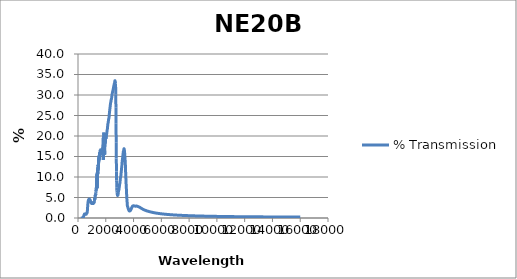
| Category | % Transmission |
|---|---|
| 200.0 | 0 |
| 201.0 | 0 |
| 202.0 | 0 |
| 203.0 | 0 |
| 204.0 | 0 |
| 205.0 | 0 |
| 206.0 | 0 |
| 207.0 | 0 |
| 208.0 | 0 |
| 209.0 | 0 |
| 210.0 | 0 |
| 211.0 | 0 |
| 212.0 | 0 |
| 213.0 | 0 |
| 214.0 | 0 |
| 215.0 | 0 |
| 216.0 | 0 |
| 217.0 | 0 |
| 218.0 | 0 |
| 219.0 | 0 |
| 220.0 | 0 |
| 221.0 | 0 |
| 222.0 | 0 |
| 223.0 | 0 |
| 224.0 | 0 |
| 225.0 | 0 |
| 226.0 | 0 |
| 227.0 | 0 |
| 228.0 | 0 |
| 229.0 | 0 |
| 230.0 | 0 |
| 231.0 | 0 |
| 232.0 | 0 |
| 233.0 | 0 |
| 234.0 | 0 |
| 235.0 | 0 |
| 236.0 | 0 |
| 237.0 | 0 |
| 238.0 | 0 |
| 239.0 | 0 |
| 240.0 | 0 |
| 241.0 | 0 |
| 242.0 | 0 |
| 243.0 | 0 |
| 244.0 | 0 |
| 245.0 | 0 |
| 246.0 | 0 |
| 247.0 | 0 |
| 248.0 | 0 |
| 249.0 | 0 |
| 250.0 | 0 |
| 251.0 | 0 |
| 252.0 | 0 |
| 253.0 | 0 |
| 254.0 | 0 |
| 255.0 | 0 |
| 256.0 | 0 |
| 257.0 | 0 |
| 258.0 | 0 |
| 259.0 | 0 |
| 260.0 | 0 |
| 261.0 | 0 |
| 262.0 | 0 |
| 263.0 | 0 |
| 264.0 | 0 |
| 265.0 | 0 |
| 266.0 | 0 |
| 267.0 | 0 |
| 268.0 | 0 |
| 269.0 | 0 |
| 270.0 | 0 |
| 271.0 | 0 |
| 272.0 | 0 |
| 273.0 | 0 |
| 274.0 | 0 |
| 275.0 | 0 |
| 276.0 | 0 |
| 277.0 | 0 |
| 278.0 | 0 |
| 279.0 | 0 |
| 280.0 | 0 |
| 281.0 | 0 |
| 282.0 | 0 |
| 283.0 | 0 |
| 284.0 | 0 |
| 285.0 | 0 |
| 286.0 | 0 |
| 287.0 | 0 |
| 288.0 | 0 |
| 289.0 | 0 |
| 290.0 | 0 |
| 291.0 | 0 |
| 292.0 | 0 |
| 293.0 | 0 |
| 294.0 | 0 |
| 295.0 | 0 |
| 296.0 | 0 |
| 297.0 | 0 |
| 298.0 | 0 |
| 299.0 | 0 |
| 300.0 | 0 |
| 301.0 | 0 |
| 302.0 | 0 |
| 303.0 | 0 |
| 304.0 | 0 |
| 305.0 | 0 |
| 306.0 | 0 |
| 307.0 | 0 |
| 308.0 | 0 |
| 309.0 | 0 |
| 310.0 | 0 |
| 311.0 | 0 |
| 312.0 | 0 |
| 313.0 | 0 |
| 314.0 | 0 |
| 315.0 | 0 |
| 316.0 | 0 |
| 317.0 | 0 |
| 318.0 | 0 |
| 319.0 | 0 |
| 320.0 | 0 |
| 321.0 | 0 |
| 322.0 | 0 |
| 323.0 | 0 |
| 324.0 | 0 |
| 325.0 | 0 |
| 326.0 | 0 |
| 327.0 | 0 |
| 328.0 | 0 |
| 329.0 | 0 |
| 330.0 | 0 |
| 331.0 | 0 |
| 332.0 | 0 |
| 333.0 | 0 |
| 334.0 | 0 |
| 335.0 | 0 |
| 336.0 | 0 |
| 337.0 | 0 |
| 338.0 | 0 |
| 339.0 | 0 |
| 340.0 | 0 |
| 341.0 | 0 |
| 342.0 | 0 |
| 343.0 | 0 |
| 344.0 | 0 |
| 345.0 | 0 |
| 346.0 | 0 |
| 347.0 | 0 |
| 348.0 | 0 |
| 349.0 | 0 |
| 350.0 | 0 |
| 351.0 | 0 |
| 352.0 | 0 |
| 353.0 | 0 |
| 354.0 | 0.001 |
| 355.0 | 0.001 |
| 356.0 | 0.001 |
| 357.0 | 0.002 |
| 358.0 | 0.002 |
| 359.0 | 0.003 |
| 360.0 | 0.004 |
| 361.0 | 0.006 |
| 362.0 | 0.007 |
| 363.0 | 0.009 |
| 364.0 | 0.011 |
| 365.0 | 0.014 |
| 366.0 | 0.016 |
| 367.0 | 0.02 |
| 368.0 | 0.023 |
| 369.0 | 0.027 |
| 370.0 | 0.031 |
| 371.0 | 0.034 |
| 372.0 | 0.037 |
| 373.0 | 0.039 |
| 374.0 | 0.04 |
| 375.0 | 0.041 |
| 376.0 | 0.041 |
| 377.0 | 0.042 |
| 378.0 | 0.044 |
| 379.0 | 0.047 |
| 380.0 | 0.051 |
| 381.0 | 0.058 |
| 382.0 | 0.067 |
| 383.0 | 0.077 |
| 384.0 | 0.09 |
| 385.0 | 0.103 |
| 386.0 | 0.118 |
| 387.0 | 0.135 |
| 388.0 | 0.153 |
| 389.0 | 0.172 |
| 390.0 | 0.192 |
| 391.0 | 0.212 |
| 392.0 | 0.231 |
| 393.0 | 0.251 |
| 394.0 | 0.272 |
| 395.0 | 0.292 |
| 396.0 | 0.312 |
| 397.0 | 0.332 |
| 398.0 | 0.351 |
| 399.0 | 0.369 |
| 400.0 | 0.387 |
| 401.0 | 0.404 |
| 402.0 | 0.42 |
| 403.0 | 0.434 |
| 404.0 | 0.446 |
| 405.0 | 0.457 |
| 406.0 | 0.466 |
| 407.0 | 0.475 |
| 408.0 | 0.484 |
| 409.0 | 0.491 |
| 410.0 | 0.497 |
| 411.0 | 0.503 |
| 412.0 | 0.51 |
| 413.0 | 0.518 |
| 414.0 | 0.526 |
| 415.0 | 0.534 |
| 416.0 | 0.542 |
| 417.0 | 0.55 |
| 418.0 | 0.56 |
| 419.0 | 0.571 |
| 420.0 | 0.583 |
| 421.0 | 0.594 |
| 422.0 | 0.604 |
| 423.0 | 0.615 |
| 424.0 | 0.626 |
| 425.0 | 0.639 |
| 426.0 | 0.652 |
| 427.0 | 0.662 |
| 428.0 | 0.671 |
| 429.0 | 0.679 |
| 430.0 | 0.687 |
| 431.0 | 0.695 |
| 432.0 | 0.702 |
| 433.0 | 0.706 |
| 434.0 | 0.708 |
| 435.0 | 0.708 |
| 436.0 | 0.71 |
| 437.0 | 0.711 |
| 438.0 | 0.713 |
| 439.0 | 0.714 |
| 440.0 | 0.714 |
| 441.0 | 0.717 |
| 442.0 | 0.722 |
| 443.0 | 0.73 |
| 444.0 | 0.74 |
| 445.0 | 0.749 |
| 446.0 | 0.759 |
| 447.0 | 0.771 |
| 448.0 | 0.786 |
| 449.0 | 0.803 |
| 450.0 | 0.82 |
| 451.0 | 0.835 |
| 452.0 | 0.849 |
| 453.0 | 0.863 |
| 454.0 | 0.879 |
| 455.0 | 0.895 |
| 456.0 | 0.909 |
| 457.0 | 0.922 |
| 458.0 | 0.932 |
| 459.0 | 0.943 |
| 460.0 | 0.954 |
| 461.0 | 0.965 |
| 462.0 | 0.974 |
| 463.0 | 0.979 |
| 464.0 | 0.982 |
| 465.0 | 0.984 |
| 466.0 | 0.987 |
| 467.0 | 0.99 |
| 468.0 | 0.991 |
| 469.0 | 0.99 |
| 470.0 | 0.986 |
| 471.0 | 0.983 |
| 472.0 | 0.981 |
| 473.0 | 0.979 |
| 474.0 | 0.976 |
| 475.0 | 0.972 |
| 476.0 | 0.967 |
| 477.0 | 0.963 |
| 478.0 | 0.96 |
| 479.0 | 0.958 |
| 480.0 | 0.954 |
| 481.0 | 0.948 |
| 482.0 | 0.94 |
| 483.0 | 0.934 |
| 484.0 | 0.93 |
| 485.0 | 0.927 |
| 486.0 | 0.924 |
| 487.0 | 0.92 |
| 488.0 | 0.915 |
| 489.0 | 0.91 |
| 490.0 | 0.906 |
| 491.0 | 0.902 |
| 492.0 | 0.899 |
| 493.0 | 0.895 |
| 494.0 | 0.891 |
| 495.0 | 0.888 |
| 496.0 | 0.887 |
| 497.0 | 0.886 |
| 498.0 | 0.885 |
| 499.0 | 0.882 |
| 500.0 | 0.878 |
| 501.0 | 0.875 |
| 502.0 | 0.874 |
| 503.0 | 0.874 |
| 504.0 | 0.873 |
| 505.0 | 0.872 |
| 506.0 | 0.87 |
| 507.0 | 0.868 |
| 508.0 | 0.869 |
| 509.0 | 0.871 |
| 510.0 | 0.874 |
| 511.0 | 0.875 |
| 512.0 | 0.875 |
| 513.0 | 0.875 |
| 514.0 | 0.877 |
| 515.0 | 0.88 |
| 516.0 | 0.884 |
| 517.0 | 0.886 |
| 518.0 | 0.888 |
| 519.0 | 0.891 |
| 520.0 | 0.895 |
| 521.0 | 0.901 |
| 522.0 | 0.906 |
| 523.0 | 0.91 |
| 524.0 | 0.913 |
| 525.0 | 0.918 |
| 526.0 | 0.924 |
| 527.0 | 0.93 |
| 528.0 | 0.936 |
| 529.0 | 0.942 |
| 530.0 | 0.947 |
| 531.0 | 0.954 |
| 532.0 | 0.962 |
| 533.0 | 0.97 |
| 534.0 | 0.978 |
| 535.0 | 0.985 |
| 536.0 | 0.99 |
| 537.0 | 0.996 |
| 538.0 | 1.002 |
| 539.0 | 1.007 |
| 540.0 | 1.013 |
| 541.0 | 1.019 |
| 542.0 | 1.024 |
| 543.0 | 1.027 |
| 544.0 | 1.03 |
| 545.0 | 1.034 |
| 546.0 | 1.039 |
| 547.0 | 1.043 |
| 548.0 | 1.046 |
| 549.0 | 1.046 |
| 550.0 | 1.046 |
| 551.0 | 1.046 |
| 552.0 | 1.048 |
| 553.0 | 1.049 |
| 554.0 | 1.048 |
| 555.0 | 1.045 |
| 556.0 | 1.04 |
| 557.0 | 1.038 |
| 558.0 | 1.037 |
| 559.0 | 1.035 |
| 560.0 | 1.03 |
| 561.0 | 1.025 |
| 562.0 | 1.021 |
| 563.0 | 1.016 |
| 564.0 | 1.012 |
| 565.0 | 1.006 |
| 566.0 | 1.001 |
| 567.0 | 0.996 |
| 568.0 | 0.991 |
| 569.0 | 0.986 |
| 570.0 | 0.98 |
| 571.0 | 0.974 |
| 572.0 | 0.969 |
| 573.0 | 0.964 |
| 574.0 | 0.958 |
| 575.0 | 0.952 |
| 576.0 | 0.946 |
| 577.0 | 0.942 |
| 578.0 | 0.938 |
| 579.0 | 0.932 |
| 580.0 | 0.926 |
| 581.0 | 0.923 |
| 582.0 | 0.92 |
| 583.0 | 0.917 |
| 584.0 | 0.914 |
| 585.0 | 0.911 |
| 586.0 | 0.91 |
| 587.0 | 0.909 |
| 588.0 | 0.91 |
| 589.0 | 0.911 |
| 590.0 | 0.912 |
| 591.0 | 0.912 |
| 592.0 | 0.914 |
| 593.0 | 0.918 |
| 594.0 | 0.921 |
| 595.0 | 0.924 |
| 596.0 | 0.927 |
| 597.0 | 0.932 |
| 598.0 | 0.938 |
| 599.0 | 0.945 |
| 600.0 | 0.952 |
| 601.0 | 0.959 |
| 602.0 | 0.964 |
| 603.0 | 0.969 |
| 604.0 | 0.975 |
| 605.0 | 0.981 |
| 606.0 | 0.989 |
| 607.0 | 0.997 |
| 608.0 | 1.004 |
| 609.0 | 1.011 |
| 610.0 | 1.018 |
| 611.0 | 1.026 |
| 612.0 | 1.034 |
| 613.0 | 1.042 |
| 614.0 | 1.051 |
| 615.0 | 1.059 |
| 616.0 | 1.066 |
| 617.0 | 1.074 |
| 618.0 | 1.082 |
| 619.0 | 1.092 |
| 620.0 | 1.099 |
| 621.0 | 1.105 |
| 622.0 | 1.11 |
| 623.0 | 1.116 |
| 624.0 | 1.123 |
| 625.0 | 1.131 |
| 626.0 | 1.139 |
| 627.0 | 1.146 |
| 628.0 | 1.151 |
| 629.0 | 1.155 |
| 630.0 | 1.16 |
| 631.0 | 1.165 |
| 632.0 | 1.171 |
| 633.0 | 1.176 |
| 634.0 | 1.179 |
| 635.0 | 1.18 |
| 636.0 | 1.184 |
| 637.0 | 1.19 |
| 638.0 | 1.195 |
| 639.0 | 1.199 |
| 640.0 | 1.203 |
| 641.0 | 1.208 |
| 642.0 | 1.214 |
| 643.0 | 1.22 |
| 644.0 | 1.227 |
| 645.0 | 1.234 |
| 646.0 | 1.241 |
| 647.0 | 1.247 |
| 648.0 | 1.255 |
| 649.0 | 1.262 |
| 650.0 | 1.27 |
| 651.0 | 1.28 |
| 652.0 | 1.291 |
| 653.0 | 1.3 |
| 654.0 | 1.308 |
| 655.0 | 1.32 |
| 656.0 | 1.335 |
| 657.0 | 1.349 |
| 658.0 | 1.362 |
| 659.0 | 1.375 |
| 660.0 | 1.391 |
| 661.0 | 1.411 |
| 662.0 | 1.432 |
| 663.0 | 1.452 |
| 664.0 | 1.471 |
| 665.0 | 1.492 |
| 666.0 | 1.515 |
| 667.0 | 1.541 |
| 668.0 | 1.567 |
| 669.0 | 1.597 |
| 670.0 | 1.625 |
| 671.0 | 1.655 |
| 672.0 | 1.687 |
| 673.0 | 1.722 |
| 674.0 | 1.758 |
| 675.0 | 1.795 |
| 676.0 | 1.833 |
| 677.0 | 1.874 |
| 678.0 | 1.916 |
| 679.0 | 1.963 |
| 680.0 | 2.012 |
| 681.0 | 2.06 |
| 682.0 | 2.104 |
| 683.0 | 2.15 |
| 684.0 | 2.197 |
| 685.0 | 2.252 |
| 686.0 | 2.303 |
| 687.0 | 2.358 |
| 688.0 | 2.406 |
| 689.0 | 2.46 |
| 690.0 | 2.515 |
| 691.0 | 2.574 |
| 692.0 | 2.627 |
| 693.0 | 2.678 |
| 694.0 | 2.728 |
| 695.0 | 2.778 |
| 696.0 | 2.827 |
| 697.0 | 2.875 |
| 698.0 | 2.922 |
| 699.0 | 2.971 |
| 700.0 | 3.021 |
| 701.0 | 3.071 |
| 702.0 | 3.113 |
| 703.0 | 3.162 |
| 704.0 | 3.203 |
| 705.0 | 3.248 |
| 706.0 | 3.284 |
| 707.0 | 3.323 |
| 708.0 | 3.364 |
| 709.0 | 3.404 |
| 710.0 | 3.446 |
| 711.0 | 3.478 |
| 712.0 | 3.508 |
| 713.0 | 3.539 |
| 714.0 | 3.574 |
| 715.0 | 3.608 |
| 716.0 | 3.641 |
| 717.0 | 3.673 |
| 718.0 | 3.705 |
| 719.0 | 3.727 |
| 720.0 | 3.76 |
| 721.0 | 3.785 |
| 722.0 | 3.817 |
| 723.0 | 3.84 |
| 724.0 | 3.861 |
| 725.0 | 3.885 |
| 726.0 | 3.906 |
| 727.0 | 3.933 |
| 728.0 | 3.955 |
| 729.0 | 3.974 |
| 730.0 | 4.001 |
| 731.0 | 4.018 |
| 732.0 | 4.042 |
| 733.0 | 4.062 |
| 734.0 | 4.08 |
| 735.0 | 4.095 |
| 736.0 | 4.111 |
| 737.0 | 4.131 |
| 738.0 | 4.151 |
| 739.0 | 4.167 |
| 740.0 | 4.181 |
| 741.0 | 4.194 |
| 742.0 | 4.205 |
| 743.0 | 4.226 |
| 744.0 | 4.241 |
| 745.0 | 4.26 |
| 746.0 | 4.266 |
| 747.0 | 4.28 |
| 748.0 | 4.287 |
| 749.0 | 4.304 |
| 750.0 | 4.319 |
| 751.0 | 4.336 |
| 752.0 | 4.347 |
| 753.0 | 4.357 |
| 754.0 | 4.371 |
| 755.0 | 4.385 |
| 756.0 | 4.398 |
| 757.0 | 4.412 |
| 758.0 | 4.421 |
| 759.0 | 4.429 |
| 760.0 | 4.431 |
| 761.0 | 4.445 |
| 762.0 | 4.455 |
| 763.0 | 4.468 |
| 764.0 | 4.47 |
| 765.0 | 4.479 |
| 766.0 | 4.488 |
| 767.0 | 4.501 |
| 768.0 | 4.508 |
| 769.0 | 4.519 |
| 770.0 | 4.521 |
| 771.0 | 4.529 |
| 772.0 | 4.531 |
| 773.0 | 4.535 |
| 774.0 | 4.54 |
| 775.0 | 4.547 |
| 776.0 | 4.552 |
| 777.0 | 4.561 |
| 778.0 | 4.568 |
| 779.0 | 4.581 |
| 780.0 | 4.582 |
| 781.0 | 4.586 |
| 782.0 | 4.595 |
| 783.0 | 4.598 |
| 784.0 | 4.594 |
| 785.0 | 4.592 |
| 786.0 | 4.596 |
| 787.0 | 4.599 |
| 788.0 | 4.601 |
| 789.0 | 4.608 |
| 790.0 | 4.617 |
| 791.0 | 4.623 |
| 792.0 | 4.626 |
| 793.0 | 4.625 |
| 794.0 | 4.627 |
| 795.0 | 4.629 |
| 796.0 | 4.629 |
| 797.0 | 4.628 |
| 798.0 | 4.63 |
| 799.0 | 4.632 |
| 800.0 | 4.634 |
| 801.0 | 4.637 |
| 802.0 | 4.635 |
| 803.0 | 4.634 |
| 804.0 | 4.628 |
| 805.0 | 4.627 |
| 806.0 | 4.628 |
| 807.0 | 4.629 |
| 808.0 | 4.631 |
| 809.0 | 4.628 |
| 810.0 | 4.623 |
| 811.0 | 4.624 |
| 812.0 | 4.628 |
| 813.0 | 4.632 |
| 814.0 | 4.63 |
| 815.0 | 4.627 |
| 816.0 | 4.628 |
| 817.0 | 4.623 |
| 818.0 | 4.619 |
| 819.0 | 4.609 |
| 820.0 | 4.613 |
| 821.0 | 4.606 |
| 822.0 | 4.608 |
| 823.0 | 4.6 |
| 824.0 | 4.6 |
| 825.0 | 4.598 |
| 826.0 | 4.604 |
| 827.0 | 4.602 |
| 828.0 | 4.601 |
| 829.0 | 4.594 |
| 830.0 | 4.593 |
| 831.0 | 4.584 |
| 832.0 | 4.58 |
| 833.0 | 4.579 |
| 834.0 | 4.579 |
| 835.0 | 4.574 |
| 836.0 | 4.567 |
| 837.0 | 4.564 |
| 838.0 | 4.561 |
| 839.0 | 4.559 |
| 840.0 | 4.556 |
| 841.0 | 4.55 |
| 842.0 | 4.546 |
| 843.0 | 4.537 |
| 844.0 | 4.531 |
| 845.0 | 4.529 |
| 846.0 | 4.526 |
| 847.0 | 4.518 |
| 848.0 | 4.504 |
| 849.0 | 4.494 |
| 850.0 | 4.494 |
| 851.0 | 4.496 |
| 852.0 | 4.492 |
| 853.0 | 4.485 |
| 854.0 | 4.479 |
| 855.0 | 4.478 |
| 856.0 | 4.47 |
| 857.0 | 4.462 |
| 858.0 | 4.458 |
| 859.0 | 4.458 |
| 860.0 | 4.442 |
| 861.0 | 4.39 |
| 862.0 | 4.302 |
| 863.0 | 4.23 |
| 864.0 | 4.202 |
| 865.0 | 4.232 |
| 866.0 | 4.285 |
| 867.0 | 4.34 |
| 868.0 | 4.334 |
| 869.0 | 4.271 |
| 870.0 | 4.196 |
| 871.0 | 4.157 |
| 872.0 | 4.148 |
| 873.0 | 4.155 |
| 874.0 | 4.181 |
| 875.0 | 4.21 |
| 876.0 | 4.225 |
| 877.0 | 4.216 |
| 878.0 | 4.189 |
| 879.0 | 4.155 |
| 880.0 | 4.132 |
| 881.0 | 4.148 |
| 882.0 | 4.182 |
| 883.0 | 4.209 |
| 884.0 | 4.188 |
| 885.0 | 4.128 |
| 886.0 | 4.077 |
| 887.0 | 4.093 |
| 888.0 | 4.156 |
| 889.0 | 4.177 |
| 890.0 | 4.128 |
| 891.0 | 4.056 |
| 892.0 | 4.029 |
| 893.0 | 4.056 |
| 894.0 | 4.103 |
| 895.0 | 4.137 |
| 896.0 | 4.112 |
| 897.0 | 4.048 |
| 898.0 | 3.994 |
| 899.0 | 3.988 |
| 900.0 | 4.027 |
| 901.0 | 4.064 |
| 902.0 | 4.049 |
| 903.0 | 3.982 |
| 904.0 | 3.93 |
| 905.0 | 3.955 |
| 906.0 | 4.021 |
| 907.0 | 4.041 |
| 908.0 | 4.009 |
| 909.0 | 3.983 |
| 910.0 | 3.974 |
| 911.0 | 3.947 |
| 912.0 | 3.902 |
| 913.0 | 3.896 |
| 914.0 | 3.91 |
| 915.0 | 3.9 |
| 916.0 | 3.865 |
| 917.0 | 3.86 |
| 918.0 | 3.908 |
| 919.0 | 3.973 |
| 920.0 | 3.998 |
| 921.0 | 3.949 |
| 922.0 | 3.881 |
| 923.0 | 3.864 |
| 924.0 | 3.911 |
| 925.0 | 3.943 |
| 926.0 | 3.898 |
| 927.0 | 3.828 |
| 928.0 | 3.817 |
| 929.0 | 3.877 |
| 930.0 | 3.921 |
| 931.0 | 3.872 |
| 932.0 | 3.771 |
| 933.0 | 3.712 |
| 934.0 | 3.743 |
| 935.0 | 3.832 |
| 936.0 | 3.874 |
| 937.0 | 3.843 |
| 938.0 | 3.788 |
| 939.0 | 3.776 |
| 940.0 | 3.793 |
| 941.0 | 3.808 |
| 942.0 | 3.795 |
| 943.0 | 3.754 |
| 944.0 | 3.716 |
| 945.0 | 3.715 |
| 946.0 | 3.743 |
| 947.0 | 3.771 |
| 948.0 | 3.764 |
| 949.0 | 3.723 |
| 950.0 | 3.689 |
| 951.0 | 3.696 |
| 952.0 | 3.717 |
| 953.0 | 3.698 |
| 954.0 | 3.659 |
| 955.0 | 3.643 |
| 956.0 | 3.664 |
| 957.0 | 3.681 |
| 958.0 | 3.697 |
| 959.0 | 3.687 |
| 960.0 | 3.657 |
| 961.0 | 3.635 |
| 962.0 | 3.631 |
| 963.0 | 3.661 |
| 964.0 | 3.678 |
| 965.0 | 3.671 |
| 966.0 | 3.668 |
| 967.0 | 3.666 |
| 968.0 | 3.651 |
| 969.0 | 3.596 |
| 970.0 | 3.564 |
| 971.0 | 3.571 |
| 972.0 | 3.618 |
| 973.0 | 3.648 |
| 974.0 | 3.647 |
| 975.0 | 3.622 |
| 976.0 | 3.613 |
| 977.0 | 3.614 |
| 978.0 | 3.607 |
| 979.0 | 3.601 |
| 980.0 | 3.599 |
| 981.0 | 3.581 |
| 982.0 | 3.536 |
| 983.0 | 3.521 |
| 984.0 | 3.533 |
| 985.0 | 3.55 |
| 986.0 | 3.583 |
| 987.0 | 3.623 |
| 988.0 | 3.638 |
| 989.0 | 3.589 |
| 990.0 | 3.527 |
| 991.0 | 3.527 |
| 992.0 | 3.546 |
| 993.0 | 3.551 |
| 994.0 | 3.503 |
| 995.0 | 3.453 |
| 996.0 | 3.464 |
| 997.0 | 3.497 |
| 998.0 | 3.531 |
| 999.0 | 3.522 |
| 1000.0 | 3.536 |
| 1001.0 | 3.551 |
| 1002.0 | 3.546 |
| 1003.0 | 3.501 |
| 1004.0 | 3.462 |
| 1005.0 | 3.489 |
| 1006.0 | 3.537 |
| 1007.0 | 3.571 |
| 1008.0 | 3.536 |
| 1009.0 | 3.484 |
| 1010.0 | 3.457 |
| 1011.0 | 3.478 |
| 1012.0 | 3.514 |
| 1013.0 | 3.538 |
| 1014.0 | 3.516 |
| 1015.0 | 3.473 |
| 1016.0 | 3.438 |
| 1017.0 | 3.461 |
| 1018.0 | 3.516 |
| 1019.0 | 3.539 |
| 1020.0 | 3.515 |
| 1021.0 | 3.456 |
| 1022.0 | 3.425 |
| 1023.0 | 3.445 |
| 1024.0 | 3.493 |
| 1025.0 | 3.526 |
| 1026.0 | 3.501 |
| 1027.0 | 3.469 |
| 1028.0 | 3.45 |
| 1029.0 | 3.48 |
| 1030.0 | 3.512 |
| 1031.0 | 3.532 |
| 1032.0 | 3.511 |
| 1033.0 | 3.469 |
| 1034.0 | 3.424 |
| 1035.0 | 3.387 |
| 1036.0 | 3.413 |
| 1037.0 | 3.46 |
| 1038.0 | 3.502 |
| 1039.0 | 3.489 |
| 1040.0 | 3.45 |
| 1041.0 | 3.422 |
| 1042.0 | 3.442 |
| 1043.0 | 3.486 |
| 1044.0 | 3.519 |
| 1045.0 | 3.506 |
| 1046.0 | 3.473 |
| 1047.0 | 3.449 |
| 1048.0 | 3.408 |
| 1049.0 | 3.386 |
| 1050.0 | 3.428 |
| 1051.0 | 3.49 |
| 1052.0 | 3.543 |
| 1053.0 | 3.524 |
| 1054.0 | 3.494 |
| 1055.0 | 3.456 |
| 1056.0 | 3.424 |
| 1057.0 | 3.399 |
| 1058.0 | 3.453 |
| 1059.0 | 3.512 |
| 1060.0 | 3.573 |
| 1061.0 | 3.57 |
| 1062.0 | 3.552 |
| 1063.0 | 3.526 |
| 1064.0 | 3.498 |
| 1065.0 | 3.464 |
| 1066.0 | 3.427 |
| 1067.0 | 3.378 |
| 1068.0 | 3.368 |
| 1069.0 | 3.436 |
| 1070.0 | 3.519 |
| 1071.0 | 3.573 |
| 1072.0 | 3.572 |
| 1073.0 | 3.567 |
| 1074.0 | 3.553 |
| 1075.0 | 3.518 |
| 1076.0 | 3.467 |
| 1077.0 | 3.433 |
| 1078.0 | 3.485 |
| 1079.0 | 3.554 |
| 1080.0 | 3.607 |
| 1081.0 | 3.575 |
| 1082.0 | 3.533 |
| 1083.0 | 3.494 |
| 1084.0 | 3.464 |
| 1085.0 | 3.504 |
| 1086.0 | 3.562 |
| 1087.0 | 3.61 |
| 1088.0 | 3.601 |
| 1089.0 | 3.575 |
| 1090.0 | 3.548 |
| 1091.0 | 3.513 |
| 1092.0 | 3.491 |
| 1093.0 | 3.555 |
| 1094.0 | 3.62 |
| 1095.0 | 3.683 |
| 1096.0 | 3.662 |
| 1097.0 | 3.63 |
| 1098.0 | 3.58 |
| 1099.0 | 3.545 |
| 1100.0 | 3.517 |
| 1101.0 | 3.523 |
| 1102.0 | 3.592 |
| 1103.0 | 3.664 |
| 1104.0 | 3.729 |
| 1105.0 | 3.731 |
| 1106.0 | 3.733 |
| 1107.0 | 3.712 |
| 1108.0 | 3.699 |
| 1109.0 | 3.693 |
| 1110.0 | 3.689 |
| 1111.0 | 3.668 |
| 1112.0 | 3.653 |
| 1113.0 | 3.633 |
| 1114.0 | 3.617 |
| 1115.0 | 3.614 |
| 1116.0 | 3.608 |
| 1117.0 | 3.597 |
| 1118.0 | 3.564 |
| 1119.0 | 3.532 |
| 1120.0 | 3.506 |
| 1121.0 | 3.528 |
| 1122.0 | 3.63 |
| 1123.0 | 3.721 |
| 1124.0 | 3.752 |
| 1125.0 | 3.719 |
| 1126.0 | 3.716 |
| 1127.0 | 3.797 |
| 1128.0 | 3.881 |
| 1129.0 | 3.919 |
| 1130.0 | 3.838 |
| 1131.0 | 3.678 |
| 1132.0 | 3.567 |
| 1133.0 | 3.574 |
| 1134.0 | 3.73 |
| 1135.0 | 3.809 |
| 1136.0 | 3.774 |
| 1137.0 | 3.668 |
| 1138.0 | 3.712 |
| 1139.0 | 3.792 |
| 1140.0 | 3.876 |
| 1141.0 | 3.868 |
| 1142.0 | 3.868 |
| 1143.0 | 3.877 |
| 1144.0 | 3.894 |
| 1145.0 | 3.909 |
| 1146.0 | 3.896 |
| 1147.0 | 3.876 |
| 1148.0 | 3.849 |
| 1149.0 | 3.85 |
| 1150.0 | 3.899 |
| 1151.0 | 3.966 |
| 1152.0 | 4.019 |
| 1153.0 | 4.014 |
| 1154.0 | 4.001 |
| 1155.0 | 3.99 |
| 1156.0 | 3.986 |
| 1157.0 | 3.972 |
| 1158.0 | 3.954 |
| 1159.0 | 3.935 |
| 1160.0 | 3.917 |
| 1161.0 | 3.895 |
| 1162.0 | 3.902 |
| 1163.0 | 3.973 |
| 1164.0 | 4.07 |
| 1165.0 | 4.132 |
| 1166.0 | 4.152 |
| 1167.0 | 4.141 |
| 1168.0 | 4.157 |
| 1169.0 | 4.165 |
| 1170.0 | 4.185 |
| 1171.0 | 4.193 |
| 1172.0 | 4.2 |
| 1173.0 | 4.206 |
| 1174.0 | 4.217 |
| 1175.0 | 4.227 |
| 1176.0 | 4.235 |
| 1177.0 | 4.252 |
| 1178.0 | 4.277 |
| 1179.0 | 4.304 |
| 1180.0 | 4.309 |
| 1181.0 | 4.298 |
| 1182.0 | 4.26 |
| 1183.0 | 4.238 |
| 1184.0 | 4.216 |
| 1185.0 | 4.254 |
| 1186.0 | 4.37 |
| 1187.0 | 4.553 |
| 1188.0 | 4.763 |
| 1189.0 | 4.842 |
| 1190.0 | 4.689 |
| 1191.0 | 4.472 |
| 1192.0 | 4.304 |
| 1193.0 | 4.318 |
| 1194.0 | 4.322 |
| 1195.0 | 4.323 |
| 1196.0 | 4.337 |
| 1197.0 | 4.423 |
| 1198.0 | 4.495 |
| 1199.0 | 4.528 |
| 1200.0 | 4.482 |
| 1201.0 | 4.466 |
| 1202.0 | 4.517 |
| 1203.0 | 4.567 |
| 1204.0 | 4.583 |
| 1205.0 | 4.563 |
| 1206.0 | 4.627 |
| 1207.0 | 4.705 |
| 1208.0 | 4.751 |
| 1209.0 | 4.726 |
| 1210.0 | 4.698 |
| 1211.0 | 4.691 |
| 1212.0 | 4.697 |
| 1213.0 | 4.715 |
| 1214.0 | 4.747 |
| 1215.0 | 4.788 |
| 1216.0 | 4.83 |
| 1217.0 | 4.815 |
| 1218.0 | 4.749 |
| 1219.0 | 4.694 |
| 1220.0 | 4.7 |
| 1221.0 | 4.767 |
| 1222.0 | 4.833 |
| 1223.0 | 4.856 |
| 1224.0 | 4.824 |
| 1225.0 | 4.782 |
| 1226.0 | 4.771 |
| 1227.0 | 4.809 |
| 1228.0 | 4.84 |
| 1229.0 | 4.879 |
| 1230.0 | 4.928 |
| 1231.0 | 4.969 |
| 1232.0 | 4.99 |
| 1233.0 | 4.99 |
| 1234.0 | 5.003 |
| 1235.0 | 5.002 |
| 1236.0 | 4.993 |
| 1237.0 | 5.027 |
| 1238.0 | 5.135 |
| 1239.0 | 5.24 |
| 1240.0 | 5.287 |
| 1241.0 | 5.274 |
| 1242.0 | 5.261 |
| 1243.0 | 5.243 |
| 1244.0 | 5.235 |
| 1245.0 | 5.29 |
| 1246.0 | 5.422 |
| 1247.0 | 5.56 |
| 1248.0 | 5.644 |
| 1249.0 | 5.594 |
| 1250.0 | 5.463 |
| 1251.0 | 5.347 |
| 1252.0 | 5.316 |
| 1253.0 | 5.378 |
| 1254.0 | 5.449 |
| 1255.0 | 5.524 |
| 1256.0 | 5.584 |
| 1257.0 | 5.592 |
| 1258.0 | 5.565 |
| 1259.0 | 5.549 |
| 1260.0 | 5.589 |
| 1261.0 | 5.653 |
| 1262.0 | 5.657 |
| 1263.0 | 5.606 |
| 1264.0 | 5.576 |
| 1265.0 | 5.624 |
| 1266.0 | 5.725 |
| 1267.0 | 5.828 |
| 1268.0 | 5.894 |
| 1269.0 | 5.872 |
| 1270.0 | 5.772 |
| 1271.0 | 5.675 |
| 1272.0 | 5.643 |
| 1273.0 | 5.677 |
| 1274.0 | 5.775 |
| 1275.0 | 5.924 |
| 1276.0 | 6.07 |
| 1277.0 | 6.156 |
| 1278.0 | 6.172 |
| 1279.0 | 6.174 |
| 1280.0 | 6.161 |
| 1281.0 | 6.148 |
| 1282.0 | 6.129 |
| 1283.0 | 6.171 |
| 1284.0 | 6.279 |
| 1285.0 | 6.388 |
| 1286.0 | 6.443 |
| 1287.0 | 6.454 |
| 1288.0 | 6.479 |
| 1289.0 | 6.5 |
| 1290.0 | 6.507 |
| 1291.0 | 6.509 |
| 1292.0 | 6.513 |
| 1293.0 | 6.532 |
| 1294.0 | 6.565 |
| 1295.0 | 6.62 |
| 1296.0 | 6.698 |
| 1297.0 | 6.77 |
| 1298.0 | 6.799 |
| 1299.0 | 6.747 |
| 1300.0 | 6.653 |
| 1301.0 | 6.599 |
| 1302.0 | 6.637 |
| 1303.0 | 6.744 |
| 1304.0 | 6.846 |
| 1305.0 | 6.944 |
| 1306.0 | 7.063 |
| 1307.0 | 7.19 |
| 1308.0 | 7.193 |
| 1309.0 | 7.104 |
| 1310.0 | 7.003 |
| 1311.0 | 6.965 |
| 1312.0 | 6.964 |
| 1313.0 | 6.966 |
| 1314.0 | 7.001 |
| 1315.0 | 7.055 |
| 1316.0 | 7.09 |
| 1317.0 | 7.138 |
| 1318.0 | 7.188 |
| 1319.0 | 7.268 |
| 1320.0 | 7.332 |
| 1321.0 | 7.378 |
| 1322.0 | 7.428 |
| 1323.0 | 7.485 |
| 1324.0 | 7.538 |
| 1325.0 | 7.582 |
| 1326.0 | 7.636 |
| 1327.0 | 7.714 |
| 1328.0 | 7.802 |
| 1329.0 | 7.902 |
| 1330.0 | 8.026 |
| 1331.0 | 8.116 |
| 1332.0 | 8.055 |
| 1333.0 | 7.907 |
| 1334.0 | 7.785 |
| 1335.0 | 7.821 |
| 1336.0 | 7.918 |
| 1337.0 | 8.034 |
| 1338.0 | 8.143 |
| 1339.0 | 8.252 |
| 1340.0 | 8.254 |
| 1341.0 | 8.217 |
| 1342.0 | 8.261 |
| 1343.0 | 8.404 |
| 1344.0 | 8.441 |
| 1345.0 | 8.274 |
| 1346.0 | 8.175 |
| 1347.0 | 8.341 |
| 1348.0 | 8.661 |
| 1349.0 | 8.802 |
| 1350.0 | 8.668 |
| 1351.0 | 8.278 |
| 1352.0 | 7.892 |
| 1353.0 | 7.871 |
| 1354.0 | 8.527 |
| 1355.0 | 9.439 |
| 1356.0 | 9.79 |
| 1357.0 | 9.148 |
| 1358.0 | 7.967 |
| 1359.0 | 7.162 |
| 1360.0 | 7.434 |
| 1361.0 | 8.491 |
| 1362.0 | 9.373 |
| 1363.0 | 9.668 |
| 1364.0 | 9.478 |
| 1365.0 | 9.147 |
| 1366.0 | 8.865 |
| 1367.0 | 8.673 |
| 1368.0 | 8.656 |
| 1369.0 | 8.729 |
| 1370.0 | 9.086 |
| 1371.0 | 9.641 |
| 1372.0 | 10.066 |
| 1373.0 | 10.165 |
| 1374.0 | 10.275 |
| 1375.0 | 10.545 |
| 1376.0 | 10.666 |
| 1377.0 | 10.142 |
| 1378.0 | 8.914 |
| 1379.0 | 7.715 |
| 1380.0 | 7.324 |
| 1381.0 | 8.03 |
| 1382.0 | 9.404 |
| 1383.0 | 10.457 |
| 1384.0 | 10.591 |
| 1385.0 | 10 |
| 1386.0 | 9.662 |
| 1387.0 | 10.207 |
| 1388.0 | 11.006 |
| 1389.0 | 11.05 |
| 1390.0 | 10.382 |
| 1391.0 | 9.589 |
| 1392.0 | 9.086 |
| 1393.0 | 8.902 |
| 1394.0 | 9.588 |
| 1395.0 | 10.933 |
| 1396.0 | 11.203 |
| 1397.0 | 10.044 |
| 1398.0 | 8.765 |
| 1399.0 | 9.462 |
| 1400.0 | 11.165 |
| 1401.0 | 11.762 |
| 1402.0 | 11.038 |
| 1403.0 | 10.134 |
| 1404.0 | 10.134 |
| 1405.0 | 10.203 |
| 1406.0 | 10.025 |
| 1407.0 | 10.09 |
| 1408.0 | 10.845 |
| 1409.0 | 11.714 |
| 1410.0 | 11.71 |
| 1411.0 | 10.927 |
| 1412.0 | 10.213 |
| 1413.0 | 10.457 |
| 1414.0 | 10.919 |
| 1415.0 | 11.045 |
| 1416.0 | 10.698 |
| 1417.0 | 10.667 |
| 1418.0 | 10.925 |
| 1419.0 | 11.205 |
| 1420.0 | 11.13 |
| 1421.0 | 10.939 |
| 1422.0 | 11.074 |
| 1423.0 | 11.5 |
| 1424.0 | 11.874 |
| 1425.0 | 11.679 |
| 1426.0 | 11.339 |
| 1427.0 | 11.153 |
| 1428.0 | 11.192 |
| 1429.0 | 11.238 |
| 1430.0 | 11.333 |
| 1431.0 | 11.509 |
| 1432.0 | 11.642 |
| 1433.0 | 11.651 |
| 1434.0 | 11.645 |
| 1435.0 | 11.734 |
| 1436.0 | 11.911 |
| 1437.0 | 12.14 |
| 1438.0 | 12.232 |
| 1439.0 | 12.026 |
| 1440.0 | 11.777 |
| 1441.0 | 11.63 |
| 1442.0 | 11.705 |
| 1443.0 | 11.849 |
| 1444.0 | 12.195 |
| 1445.0 | 12.506 |
| 1446.0 | 12.555 |
| 1447.0 | 12.136 |
| 1448.0 | 11.883 |
| 1449.0 | 11.968 |
| 1450.0 | 12.309 |
| 1451.0 | 12.49 |
| 1452.0 | 12.496 |
| 1453.0 | 12.526 |
| 1454.0 | 12.658 |
| 1455.0 | 12.873 |
| 1456.0 | 13.023 |
| 1457.0 | 12.861 |
| 1458.0 | 12.66 |
| 1459.0 | 12.607 |
| 1460.0 | 12.812 |
| 1461.0 | 12.914 |
| 1462.0 | 12.773 |
| 1463.0 | 12.67 |
| 1464.0 | 12.688 |
| 1465.0 | 12.906 |
| 1466.0 | 12.955 |
| 1467.0 | 12.68 |
| 1468.0 | 12.397 |
| 1469.0 | 12.307 |
| 1470.0 | 12.853 |
| 1471.0 | 13.388 |
| 1472.0 | 13.819 |
| 1473.0 | 13.778 |
| 1474.0 | 13.358 |
| 1475.0 | 13.001 |
| 1476.0 | 12.772 |
| 1477.0 | 12.869 |
| 1478.0 | 12.926 |
| 1479.0 | 13.342 |
| 1480.0 | 13.793 |
| 1481.0 | 14.231 |
| 1482.0 | 14.138 |
| 1483.0 | 13.821 |
| 1484.0 | 13.502 |
| 1485.0 | 13.363 |
| 1486.0 | 13.447 |
| 1487.0 | 13.476 |
| 1488.0 | 13.481 |
| 1489.0 | 13.465 |
| 1490.0 | 13.511 |
| 1491.0 | 13.558 |
| 1492.0 | 13.601 |
| 1493.0 | 13.713 |
| 1494.0 | 13.817 |
| 1495.0 | 14.02 |
| 1496.0 | 14.181 |
| 1497.0 | 14.376 |
| 1498.0 | 14.396 |
| 1499.0 | 14.15 |
| 1500.0 | 13.861 |
| 1501.0 | 13.728 |
| 1502.0 | 13.84 |
| 1503.0 | 14.048 |
| 1504.0 | 14.222 |
| 1505.0 | 14.503 |
| 1506.0 | 14.58 |
| 1507.0 | 14.393 |
| 1508.0 | 14.154 |
| 1509.0 | 14.094 |
| 1510.0 | 14.247 |
| 1511.0 | 14.411 |
| 1512.0 | 14.56 |
| 1513.0 | 14.71 |
| 1514.0 | 14.527 |
| 1515.0 | 14.362 |
| 1516.0 | 14.267 |
| 1517.0 | 14.454 |
| 1518.0 | 14.7 |
| 1519.0 | 14.907 |
| 1520.0 | 14.979 |
| 1521.0 | 14.763 |
| 1522.0 | 14.554 |
| 1523.0 | 14.493 |
| 1524.0 | 14.608 |
| 1525.0 | 14.729 |
| 1526.0 | 14.855 |
| 1527.0 | 15.039 |
| 1528.0 | 15.094 |
| 1529.0 | 14.842 |
| 1530.0 | 14.614 |
| 1531.0 | 14.511 |
| 1532.0 | 14.643 |
| 1533.0 | 14.755 |
| 1534.0 | 14.878 |
| 1535.0 | 15.066 |
| 1536.0 | 15.222 |
| 1537.0 | 15.371 |
| 1538.0 | 15.384 |
| 1539.0 | 15.179 |
| 1540.0 | 14.953 |
| 1541.0 | 14.84 |
| 1542.0 | 14.952 |
| 1543.0 | 15.026 |
| 1544.0 | 15.143 |
| 1545.0 | 15.265 |
| 1546.0 | 15.457 |
| 1547.0 | 15.564 |
| 1548.0 | 15.509 |
| 1549.0 | 15.263 |
| 1550.0 | 15.025 |
| 1551.0 | 14.905 |
| 1552.0 | 14.984 |
| 1553.0 | 15.186 |
| 1554.0 | 15.449 |
| 1555.0 | 15.738 |
| 1556.0 | 15.752 |
| 1557.0 | 15.488 |
| 1558.0 | 15.158 |
| 1559.0 | 15.071 |
| 1560.0 | 15.221 |
| 1561.0 | 15.42 |
| 1562.0 | 15.621 |
| 1563.0 | 15.88 |
| 1564.0 | 15.984 |
| 1565.0 | 15.784 |
| 1566.0 | 15.531 |
| 1567.0 | 15.461 |
| 1568.0 | 15.669 |
| 1569.0 | 15.871 |
| 1570.0 | 15.84 |
| 1571.0 | 15.555 |
| 1572.0 | 15.329 |
| 1573.0 | 15.276 |
| 1574.0 | 15.515 |
| 1575.0 | 15.723 |
| 1576.0 | 15.89 |
| 1577.0 | 15.839 |
| 1578.0 | 15.588 |
| 1579.0 | 15.421 |
| 1580.0 | 15.349 |
| 1581.0 | 15.466 |
| 1582.0 | 15.607 |
| 1583.0 | 15.817 |
| 1584.0 | 16.018 |
| 1585.0 | 16.084 |
| 1586.0 | 16.017 |
| 1587.0 | 15.771 |
| 1588.0 | 15.561 |
| 1589.0 | 15.425 |
| 1590.0 | 15.431 |
| 1591.0 | 15.431 |
| 1592.0 | 15.49 |
| 1593.0 | 15.6 |
| 1594.0 | 15.717 |
| 1595.0 | 15.781 |
| 1596.0 | 15.787 |
| 1597.0 | 15.845 |
| 1598.0 | 15.925 |
| 1599.0 | 15.979 |
| 1600.0 | 16.006 |
| 1601.0 | 16.058 |
| 1602.0 | 16.174 |
| 1603.0 | 16.312 |
| 1604.0 | 16.435 |
| 1605.0 | 16.545 |
| 1606.0 | 16.611 |
| 1607.0 | 16.546 |
| 1608.0 | 16.234 |
| 1609.0 | 15.908 |
| 1610.0 | 15.727 |
| 1611.0 | 15.765 |
| 1612.0 | 15.851 |
| 1613.0 | 15.94 |
| 1614.0 | 16.003 |
| 1615.0 | 16.009 |
| 1616.0 | 15.983 |
| 1617.0 | 15.976 |
| 1618.0 | 15.996 |
| 1619.0 | 16.049 |
| 1620.0 | 16.145 |
| 1621.0 | 16.294 |
| 1622.0 | 16.414 |
| 1623.0 | 16.356 |
| 1624.0 | 16.117 |
| 1625.0 | 15.926 |
| 1626.0 | 15.88 |
| 1627.0 | 15.989 |
| 1628.0 | 16.096 |
| 1629.0 | 16.261 |
| 1630.0 | 16.367 |
| 1631.0 | 16.26 |
| 1632.0 | 15.985 |
| 1633.0 | 15.818 |
| 1634.0 | 15.873 |
| 1635.0 | 16.066 |
| 1636.0 | 16.248 |
| 1637.0 | 16.369 |
| 1638.0 | 16.282 |
| 1639.0 | 16.034 |
| 1640.0 | 15.853 |
| 1641.0 | 15.919 |
| 1642.0 | 16.154 |
| 1643.0 | 16.349 |
| 1644.0 | 16.326 |
| 1645.0 | 16.067 |
| 1646.0 | 15.784 |
| 1647.0 | 15.729 |
| 1648.0 | 15.915 |
| 1649.0 | 16.13 |
| 1650.0 | 16.334 |
| 1651.0 | 16.46 |
| 1652.0 | 16.356 |
| 1653.0 | 16.064 |
| 1654.0 | 15.817 |
| 1655.0 | 15.774 |
| 1656.0 | 15.888 |
| 1657.0 | 16.039 |
| 1658.0 | 16.253 |
| 1659.0 | 16.469 |
| 1660.0 | 16.631 |
| 1661.0 | 16.777 |
| 1662.0 | 16.905 |
| 1663.0 | 16.852 |
| 1664.0 | 16.581 |
| 1665.0 | 16.285 |
| 1666.0 | 16.221 |
| 1667.0 | 16.454 |
| 1668.0 | 16.792 |
| 1669.0 | 16.895 |
| 1670.0 | 16.588 |
| 1671.0 | 16.116 |
| 1672.0 | 15.81 |
| 1673.0 | 15.783 |
| 1674.0 | 15.865 |
| 1675.0 | 15.991 |
| 1676.0 | 16.132 |
| 1677.0 | 16.295 |
| 1678.0 | 16.387 |
| 1679.0 | 16.261 |
| 1680.0 | 16.004 |
| 1681.0 | 15.749 |
| 1682.0 | 15.723 |
| 1683.0 | 15.818 |
| 1684.0 | 15.917 |
| 1685.0 | 16.009 |
| 1686.0 | 16.149 |
| 1687.0 | 16.374 |
| 1688.0 | 16.534 |
| 1689.0 | 16.378 |
| 1690.0 | 16.064 |
| 1691.0 | 15.827 |
| 1692.0 | 15.855 |
| 1693.0 | 16.004 |
| 1694.0 | 16.123 |
| 1695.0 | 16.209 |
| 1696.0 | 16.272 |
| 1697.0 | 16.365 |
| 1698.0 | 16.396 |
| 1699.0 | 16.204 |
| 1700.0 | 15.877 |
| 1701.0 | 15.606 |
| 1702.0 | 15.612 |
| 1703.0 | 15.752 |
| 1704.0 | 15.885 |
| 1705.0 | 15.898 |
| 1706.0 | 15.883 |
| 1707.0 | 15.908 |
| 1708.0 | 15.996 |
| 1709.0 | 16.108 |
| 1710.0 | 16.192 |
| 1711.0 | 16.326 |
| 1712.0 | 16.498 |
| 1713.0 | 16.614 |
| 1714.0 | 16.441 |
| 1715.0 | 16.114 |
| 1716.0 | 15.825 |
| 1717.0 | 15.789 |
| 1718.0 | 15.832 |
| 1719.0 | 15.861 |
| 1720.0 | 15.926 |
| 1721.0 | 16.016 |
| 1722.0 | 16.104 |
| 1723.0 | 16.101 |
| 1724.0 | 16.106 |
| 1725.0 | 16.185 |
| 1726.0 | 16.34 |
| 1727.0 | 16.509 |
| 1728.0 | 16.587 |
| 1729.0 | 16.376 |
| 1730.0 | 16.091 |
| 1731.0 | 15.858 |
| 1732.0 | 15.84 |
| 1733.0 | 15.842 |
| 1734.0 | 15.842 |
| 1735.0 | 15.852 |
| 1736.0 | 15.85 |
| 1737.0 | 15.876 |
| 1738.0 | 15.95 |
| 1739.0 | 16.028 |
| 1740.0 | 16.135 |
| 1741.0 | 16.23 |
| 1742.0 | 16.347 |
| 1743.0 | 16.438 |
| 1744.0 | 16.58 |
| 1745.0 | 16.645 |
| 1746.0 | 16.4 |
| 1747.0 | 16.076 |
| 1748.0 | 15.839 |
| 1749.0 | 15.843 |
| 1750.0 | 15.868 |
| 1751.0 | 15.916 |
| 1752.0 | 15.97 |
| 1753.0 | 16.009 |
| 1754.0 | 16.046 |
| 1755.0 | 16.119 |
| 1756.0 | 16.219 |
| 1757.0 | 16.261 |
| 1758.0 | 16.382 |
| 1759.0 | 16.489 |
| 1760.0 | 16.65 |
| 1761.0 | 16.706 |
| 1762.0 | 16.489 |
| 1763.0 | 16.167 |
| 1764.0 | 15.856 |
| 1765.0 | 15.824 |
| 1766.0 | 15.848 |
| 1767.0 | 15.872 |
| 1768.0 | 15.869 |
| 1769.0 | 15.88 |
| 1770.0 | 15.864 |
| 1771.0 | 15.783 |
| 1772.0 | 15.704 |
| 1773.0 | 15.688 |
| 1774.0 | 15.71 |
| 1775.0 | 15.701 |
| 1776.0 | 15.692 |
| 1777.0 | 15.871 |
| 1778.0 | 16.123 |
| 1779.0 | 16.33 |
| 1780.0 | 16.528 |
| 1781.0 | 16.768 |
| 1782.0 | 16.917 |
| 1783.0 | 16.802 |
| 1784.0 | 16.597 |
| 1785.0 | 16.621 |
| 1786.0 | 16.743 |
| 1787.0 | 16.766 |
| 1788.0 | 16.562 |
| 1789.0 | 16.336 |
| 1790.0 | 16.293 |
| 1791.0 | 16.332 |
| 1792.0 | 16.468 |
| 1793.0 | 16.627 |
| 1794.0 | 16.822 |
| 1795.0 | 17.116 |
| 1796.0 | 17.243 |
| 1797.0 | 17 |
| 1798.0 | 16.485 |
| 1799.0 | 16.16 |
| 1800.0 | 16.324 |
| 1801.0 | 16.653 |
| 1802.0 | 16.736 |
| 1803.0 | 16.518 |
| 1804.0 | 16.385 |
| 1805.0 | 16.533 |
| 1806.0 | 16.895 |
| 1807.0 | 17.02 |
| 1808.0 | 16.776 |
| 1809.0 | 16.425 |
| 1810.0 | 16.334 |
| 1811.0 | 16.23 |
| 1812.0 | 16.337 |
| 1813.0 | 16.517 |
| 1814.0 | 17.284 |
| 1815.0 | 17.898 |
| 1816.0 | 17.471 |
| 1817.0 | 15.914 |
| 1818.0 | 14.334 |
| 1819.0 | 14.155 |
| 1820.0 | 15.978 |
| 1821.0 | 18.33 |
| 1822.0 | 19.546 |
| 1823.0 | 18.714 |
| 1824.0 | 17.043 |
| 1825.0 | 15.82 |
| 1826.0 | 15.334 |
| 1827.0 | 15.341 |
| 1828.0 | 15.867 |
| 1829.0 | 17.043 |
| 1830.0 | 18.452 |
| 1831.0 | 18.83 |
| 1832.0 | 18.021 |
| 1833.0 | 16.443 |
| 1834.0 | 15.604 |
| 1835.0 | 15.49 |
| 1836.0 | 15.494 |
| 1837.0 | 14.917 |
| 1838.0 | 14.307 |
| 1839.0 | 14.926 |
| 1840.0 | 16.002 |
| 1841.0 | 16.99 |
| 1842.0 | 16.99 |
| 1843.0 | 16.99 |
| 1844.0 | 17.535 |
| 1845.0 | 17.535 |
| 1846.0 | 17.535 |
| 1847.0 | 16.99 |
| 1848.0 | 18.411 |
| 1849.0 | 18.969 |
| 1850.0 | 19.526 |
| 1851.0 | 18.664 |
| 1852.0 | 17.818 |
| 1853.0 | 17.776 |
| 1854.0 | 17.712 |
| 1855.0 | 17.971 |
| 1856.0 | 17.949 |
| 1857.0 | 17.979 |
| 1858.0 | 17.725 |
| 1859.0 | 17.755 |
| 1860.0 | 18.391 |
| 1861.0 | 20.159 |
| 1862.0 | 20.827 |
| 1863.0 | 20.095 |
| 1864.0 | 19.339 |
| 1865.0 | 18.202 |
| 1866.0 | 17.828 |
| 1867.0 | 16.264 |
| 1868.0 | 16.939 |
| 1869.0 | 17.614 |
| 1870.0 | 19.178 |
| 1871.0 | 19.178 |
| 1872.0 | 18.503 |
| 1873.0 | 18.041 |
| 1874.0 | 17.584 |
| 1875.0 | 18.259 |
| 1876.0 | 19.134 |
| 1877.0 | 19.9 |
| 1878.0 | 19.688 |
| 1879.0 | 18.451 |
| 1880.0 | 17.137 |
| 1881.0 | 16.597 |
| 1882.0 | 17.048 |
| 1883.0 | 17.861 |
| 1884.0 | 18.401 |
| 1885.0 | 18.552 |
| 1886.0 | 18.324 |
| 1887.0 | 17.488 |
| 1888.0 | 16.568 |
| 1889.0 | 16.006 |
| 1890.0 | 16.434 |
| 1891.0 | 17.766 |
| 1892.0 | 19.294 |
| 1893.0 | 20.144 |
| 1894.0 | 19.579 |
| 1895.0 | 17.872 |
| 1896.0 | 16.185 |
| 1897.0 | 15.442 |
| 1898.0 | 16.196 |
| 1899.0 | 17.635 |
| 1900.0 | 18.558 |
| 1901.0 | 18.298 |
| 1902.0 | 18.122 |
| 1903.0 | 18.122 |
| 1904.0 | 18.595 |
| 1905.0 | 19.071 |
| 1906.0 | 20.048 |
| 1907.0 | 20.738 |
| 1908.0 | 20.021 |
| 1909.0 | 18.183 |
| 1910.0 | 16.529 |
| 1911.0 | 16.23 |
| 1912.0 | 16.981 |
| 1913.0 | 18.529 |
| 1914.0 | 19.738 |
| 1915.0 | 19.969 |
| 1916.0 | 18.723 |
| 1917.0 | 16.796 |
| 1918.0 | 15.506 |
| 1919.0 | 15.486 |
| 1920.0 | 16.687 |
| 1921.0 | 18.03 |
| 1922.0 | 18.756 |
| 1923.0 | 18.608 |
| 1924.0 | 18.041 |
| 1925.0 | 17.542 |
| 1926.0 | 17.368 |
| 1927.0 | 17.649 |
| 1928.0 | 18.149 |
| 1929.0 | 18.523 |
| 1930.0 | 18.599 |
| 1931.0 | 18.438 |
| 1932.0 | 18.359 |
| 1933.0 | 18.304 |
| 1934.0 | 18.203 |
| 1935.0 | 18.181 |
| 1936.0 | 18.086 |
| 1937.0 | 18.036 |
| 1938.0 | 18.135 |
| 1939.0 | 18.517 |
| 1940.0 | 19.037 |
| 1941.0 | 19.089 |
| 1942.0 | 18.741 |
| 1943.0 | 18.443 |
| 1944.0 | 18.294 |
| 1945.0 | 18.481 |
| 1946.0 | 18.673 |
| 1947.0 | 18.898 |
| 1948.0 | 18.835 |
| 1949.0 | 18.672 |
| 1950.0 | 18.567 |
| 1951.0 | 18.505 |
| 1952.0 | 18.467 |
| 1953.0 | 18.599 |
| 1954.0 | 18.838 |
| 1955.0 | 18.828 |
| 1956.0 | 18.586 |
| 1957.0 | 18.624 |
| 1958.0 | 18.979 |
| 1959.0 | 19.231 |
| 1960.0 | 19.05 |
| 1961.0 | 18.77 |
| 1962.0 | 18.768 |
| 1963.0 | 18.891 |
| 1964.0 | 19.071 |
| 1965.0 | 18.99 |
| 1966.0 | 19.07 |
| 1967.0 | 19.185 |
| 1968.0 | 19.305 |
| 1969.0 | 19.204 |
| 1970.0 | 18.954 |
| 1971.0 | 18.946 |
| 1972.0 | 19.329 |
| 1973.0 | 19.669 |
| 1974.0 | 19.828 |
| 1975.0 | 19.657 |
| 1976.0 | 19.611 |
| 1977.0 | 19.599 |
| 1978.0 | 19.525 |
| 1979.0 | 19.43 |
| 1980.0 | 19.32 |
| 1981.0 | 19.29 |
| 1982.0 | 19.253 |
| 1983.0 | 19.259 |
| 1984.0 | 19.282 |
| 1985.0 | 19.31 |
| 1986.0 | 19.379 |
| 1987.0 | 19.493 |
| 1988.0 | 19.662 |
| 1989.0 | 19.831 |
| 1990.0 | 19.966 |
| 1991.0 | 19.851 |
| 1992.0 | 19.542 |
| 1993.0 | 19.28 |
| 1994.0 | 19.322 |
| 1995.0 | 19.582 |
| 1996.0 | 19.885 |
| 1997.0 | 20.127 |
| 1998.0 | 20.109 |
| 1999.0 | 19.823 |
| 2000.065834 | 19.484 |
| 2009.942668 | 19.342 |
| 2020.098566 | 19.547 |
| 2029.969298 | 19.739 |
| 2039.837 | 20.075 |
| 2049.98346 | 20.184 |
| 2059.844971 | 20.408 |
| 2069.985031 | 20.62 |
| 2079.840289 | 20.943 |
| 2089.973887 | 21.218 |
| 2099.822832 | 21.461 |
| 2109.949906 | 21.639 |
| 2119.792477 | 21.875 |
| 2129.912964 | 22.233 |
| 2140.030088 | 22.552 |
| 2149.862941 | 22.914 |
| 2159.973384 | 23.016 |
| 2169.799712 | 23.229 |
| 2179.903413 | 23.406 |
| 2190.003671 | 23.708 |
| 2199.820052 | 23.944 |
| 2209.913475 | 24.12 |
| 2219.723179 | 24.276 |
| 2229.809704 | 24.401 |
| 2239.892708 | 24.687 |
| 2249.692237 | 25.017 |
| 2259.76825 | 25.501 |
| 2269.840694 | 25.816 |
| 2279.909553 | 26.166 |
| 2289.695271 | 26.445 |
| 2299.757015 | 26.749 |
| 2309.815127 | 27.046 |
| 2319.869592 | 27.285 |
| 2329.641254 | 27.635 |
| 2339.688478 | 27.843 |
| 2349.732008 | 28.081 |
| 2359.771828 | 28.245 |
| 2369.80792 | 28.388 |
| 2379.840271 | 28.7 |
| 2389.590342 | 28.843 |
| 2399.615266 | 28.977 |
| 2409.6364 | 29.046 |
| 2419.65373 | 29.224 |
| 2429.667238 | 29.524 |
| 2439.676909 | 29.749 |
| 2449.682728 | 30.038 |
| 2459.684679 | 30.236 |
| 2469.682745 | 30.435 |
| 2479.676911 | 30.62 |
| 2489.667162 | 30.786 |
| 2499.653481 | 30.926 |
| 2509.635853 | 31.053 |
| 2519.614261 | 31.176 |
| 2529.588691 | 31.276 |
| 2539.559127 | 31.473 |
| 2549.525552 | 31.639 |
| 2559.487951 | 31.908 |
| 2569.722871 | 32.002 |
| 2579.677058 | 32.198 |
| 2589.627171 | 32.411 |
| 2599.573195 | 32.509 |
| 2609.515113 | 32.688 |
| 2619.452911 | 32.755 |
| 2629.662448 | 32.897 |
| 2639.591842 | 33.086 |
| 2649.517067 | 33.32 |
| 2659.438109 | 33.501 |
| 2669.630358 | 33.416 |
| 2679.542867 | 33.236 |
| 2689.451145 | 33.151 |
| 2699.630227 | 32.812 |
| 2709.529877 | 31.933 |
| 2719.425248 | 30.183 |
| 2729.591015 | 27.022 |
| 2739.477662 | 22.994 |
| 2749.359982 | 18.337 |
| 2759.512287 | 14.538 |
| 2769.385788 | 11.337 |
| 2779.528995 | 9.133 |
| 2789.393611 | 7.495 |
| 2799.527654 | 6.654 |
| 2809.383323 | 6.24 |
| 2819.508136 | 6.02 |
| 2829.354792 | 5.789 |
| 2839.47031 | 5.546 |
| 2849.30789 | 5.486 |
| 2859.414046 | 5.504 |
| 2869.515434 | 5.574 |
| 2879.339216 | 5.652 |
| 2889.431143 | 5.795 |
| 2899.24569 | 6.164 |
| 2909.328092 | 6.443 |
| 2919.40564 | 6.683 |
| 2929.206149 | 6.689 |
| 2939.274073 | 6.798 |
| 2949.337095 | 6.986 |
| 2959.395197 | 7.237 |
| 2969.17672 | 7.522 |
| 2979.225066 | 7.684 |
| 2989.268442 | 8.124 |
| 2999.306833 | 8.248 |
| 3009.34022 | 8.437 |
| 3019.368587 | 8.495 |
| 3029.391918 | 8.874 |
| 3039.139497 | 9.33 |
| 3049.152842 | 9.585 |
| 3059.1611 | 9.857 |
| 3069.164256 | 10.017 |
| 3079.162292 | 10.136 |
| 3089.155191 | 10.412 |
| 3099.142938 | 10.723 |
| 3109.125515 | 11.172 |
| 3119.102905 | 11.431 |
| 3129.075093 | 11.817 |
| 3139.311366 | 12.15 |
| 3149.272956 | 12.495 |
| 3159.229293 | 12.814 |
| 3169.18036 | 13.219 |
| 3179.126141 | 13.717 |
| 3189.066618 | 13.975 |
| 3199.27022 | 14.287 |
| 3209.199897 | 14.532 |
| 3219.124221 | 14.892 |
| 3229.043176 | 15.157 |
| 3239.224603 | 15.395 |
| 3249.132622 | 15.756 |
| 3259.035221 | 16.072 |
| 3269.199799 | 16.277 |
| 3279.091361 | 16.348 |
| 3288.977454 | 16.455 |
| 3299.125027 | 16.667 |
| 3308.999981 | 16.893 |
| 3319.136081 | 16.872 |
| 3328.999829 | 16.745 |
| 3339.124385 | 16.527 |
| 3348.976861 | 16.272 |
| 3359.089804 | 15.809 |
| 3368.930939 | 15.175 |
| 3379.0322 | 14.725 |
| 3389.127517 | 14.284 |
| 3398.951437 | 13.887 |
| 3409.034967 | 13.186 |
| 3419.112499 | 12.267 |
| 3428.919052 | 11.203 |
| 3438.984693 | 10.33 |
| 3449.044284 | 9.519 |
| 3458.833318 | 8.71 |
| 3468.880914 | 8.016 |
| 3478.922407 | 7.349 |
| 3488.957779 | 6.764 |
| 3498.987012 | 5.929 |
| 3509.010089 | 5.207 |
| 3519.026992 | 4.632 |
| 3529.037703 | 4.254 |
| 3538.779008 | 3.791 |
| 3548.777448 | 3.244 |
| 3558.769643 | 2.955 |
| 3568.755577 | 2.82 |
| 3578.997769 | 2.703 |
| 3588.970961 | 2.703 |
| 3598.937838 | 2.523 |
| 3608.898383 | 2.38 |
| 3618.852578 | 2.263 |
| 3628.800407 | 2.166 |
| 3638.74185 | 2.068 |
| 3648.938253 | 1.978 |
| 3658.866705 | 1.917 |
| 3668.788719 | 1.846 |
| 3678.704279 | 1.789 |
| 3688.874043 | 1.739 |
| 3698.776469 | 1.713 |
| 3708.672387 | 1.703 |
| 3718.821938 | 1.702 |
| 3728.704616 | 1.728 |
| 3738.840542 | 1.754 |
| 3748.709907 | 1.786 |
| 3758.832135 | 1.797 |
| 3768.688117 | 1.812 |
| 3778.796573 | 1.832 |
| 3788.639101 | 1.888 |
| 3798.733711 | 1.959 |
| 3808.821282 | 2.029 |
| 3818.643407 | 2.104 |
| 3828.717023 | 2.185 |
| 3838.783543 | 2.283 |
| 3848.585104 | 2.373 |
| 3858.637559 | 2.45 |
| 3868.682864 | 2.526 |
| 3878.720999 | 2.6 |
| 3888.751945 | 2.682 |
| 3898.518755 | 2.748 |
| 3908.535455 | 2.798 |
| 3918.54491 | 2.838 |
| 3928.547104 | 2.87 |
| 3938.542016 | 2.901 |
| 3948.52963 | 2.924 |
| 3958.509925 | 2.949 |
| 3968.482884 | 2.973 |
| 3978.70392 | 2.99 |
| 3988.661962 | 2.997 |
| 3998.612612 | 2.992 |
| 4008.555852 | 2.984 |
| 4018.491662 | 2.968 |
| 4028.6745 | 2.95 |
| 4038.595205 | 2.938 |
| 4048.508426 | 2.927 |
| 4058.414143 | 2.921 |
| 4068.56604 | 2.915 |
| 4078.456503 | 2.914 |
| 4088.592715 | 2.909 |
| 4098.467848 | 2.902 |
| 4108.588299 | 2.894 |
| 4118.448027 | 2.889 |
| 4128.552639 | 2.889 |
| 4138.396887 | 2.889 |
| 4148.485584 | 2.89 |
| 4158.566193 | 2.89 |
| 4168.386981 | 2.898 |
| 4178.45156 | 2.905 |
| 4188.507992 | 2.908 |
| 4198.305151 | 2.906 |
| 4208.345437 | 2.904 |
| 4218.377519 | 2.904 |
| 4228.401377 | 2.914 |
| 4238.416991 | 2.907 |
| 4248.424343 | 2.9 |
| 4258.423411 | 2.876 |
| 4268.414178 | 2.859 |
| 4278.396623 | 2.84 |
| 4288.370728 | 2.829 |
| 4298.336471 | 2.82 |
| 4308.293836 | 2.812 |
| 4318.2428 | 2.803 |
| 4328.431752 | 2.79 |
| 4338.363649 | 2.774 |
| 4348.287088 | 2.755 |
| 4358.20205 | 2.74 |
| 4368.356068 | 2.728 |
| 4378.253805 | 2.713 |
| 4388.390126 | 2.7 |
| 4398.270558 | 2.684 |
| 4408.389101 | 2.668 |
| 4418.252149 | 2.652 |
| 4428.352834 | 2.633 |
| 4438.198419 | 2.613 |
| 4448.281165 | 2.595 |
| 4458.354799 | 2.577 |
| 4468.173935 | 2.56 |
| 4478.229508 | 2.538 |
| 4488.275909 | 2.516 |
| 4498.313117 | 2.493 |
| 4508.096635 | 2.472 |
| 4518.115621 | 2.453 |
| 4528.125352 | 2.432 |
| 4538.125809 | 2.41 |
| 4548.11697 | 2.385 |
| 4558.098816 | 2.364 |
| 4568.071325 | 2.344 |
| 4578.277365 | 2.326 |
| 4588.230912 | 2.305 |
| 4598.175061 | 2.283 |
| 4608.109792 | 2.263 |
| 4618.035085 | 2.243 |
| 4628.192649 | 2.224 |
| 4638.098772 | 2.206 |
| 4647.995395 | 2.188 |
| 4658.123528 | 2.168 |
| 4668.000857 | 2.148 |
| 4678.109183 | 2.129 |
| 4687.967136 | 2.111 |
| 4698.05557 | 2.094 |
| 4708.133906 | 2.077 |
| 4717.962521 | 2.059 |
| 4728.020838 | 2.041 |
| 4738.068993 | 2.024 |
| 4748.106964 | 2.008 |
| 4758.13473 | 1.992 |
| 4767.913874 | 1.978 |
| 4777.921408 | 1.963 |
| 4787.918673 | 1.949 |
| 4797.905646 | 1.935 |
| 4807.882307 | 1.919 |
| 4818.085802 | 1.907 |
| 4828.041526 | 1.892 |
| 4837.986874 | 1.88 |
| 4847.921823 | 1.87 |
| 4857.846351 | 1.857 |
| 4867.996361 | 1.843 |
| 4877.899737 | 1.829 |
| 4888.028045 | 1.818 |
| 4897.910179 | 1.808 |
| 4908.016697 | 1.796 |
| 4917.877504 | 1.783 |
| 4927.962141 | 1.771 |
| 4937.801534 | 1.758 |
| 4947.864203 | 1.746 |
| 4957.915724 | 1.734 |
| 4967.956075 | 1.722 |
| 4977.985234 | 1.712 |
| 4987.77033 | 1.702 |
| 4997.777298 | 1.691 |
| 5007.776688 | 1.681 |
| 5017.595804 | 1.67 |
| 5028.169082 | 1.66 |
| 5037.98605 | 1.649 |
| 5047.80198 | 1.639 |
| 5057.616872 | 1.631 |
| 5068.18559 | 1.622 |
| 5077.998316 | 1.612 |
| 5087.809996 | 1.603 |
| 5097.620628 | 1.593 |
| 5107.430211 | 1.585 |
| 5117.993201 | 1.575 |
| 5127.800597 | 1.566 |
| 5137.606938 | 1.558 |
| 5147.41222 | 1.548 |
| 5157.970569 | 1.538 |
| 5167.773648 | 1.53 |
| 5177.575662 | 1.522 |
| 5187.376611 | 1.514 |
| 5197.930283 | 1.505 |
| 5207.729011 | 1.497 |
| 5217.526666 | 1.488 |
| 5227.323247 | 1.482 |
| 5237.872207 | 1.474 |
| 5247.666549 | 1.465 |
| 5257.459812 | 1.457 |
| 5268.005191 | 1.449 |
| 5277.796202 | 1.44 |
| 5287.586127 | 1.432 |
| 5297.374963 | 1.424 |
| 5307.915566 | 1.416 |
| 5317.702134 | 1.408 |
| 5327.487607 | 1.4 |
| 5337.271982 | 1.392 |
| 5347.807773 | 1.385 |
| 5357.589864 | 1.377 |
| 5367.370852 | 1.37 |
| 5377.902987 | 1.362 |
| 5387.681677 | 1.355 |
| 5397.459258 | 1.348 |
| 5407.235727 | 1.34 |
| 5417.762987 | 1.333 |
| 5427.537141 | 1.326 |
| 5437.310177 | 1.319 |
| 5447.833734 | 1.312 |
| 5457.604442 | 1.306 |
| 5467.374028 | 1.299 |
| 5477.142487 | 1.292 |
| 5487.661104 | 1.286 |
| 5497.427219 | 1.279 |
| 5507.192201 | 1.273 |
| 5517.707068 | 1.266 |
| 5527.469693 | 1.26 |
| 5537.231179 | 1.254 |
| 5547.742274 | 1.247 |
| 5557.50139 | 1.241 |
| 5567.259362 | 1.235 |
| 5577.766665 | 1.229 |
| 5587.522253 | 1.223 |
| 5597.276691 | 1.217 |
| 5607.780182 | 1.211 |
| 5617.532223 | 1.206 |
| 5627.283108 | 1.2 |
| 5637.032835 | 1.194 |
| 5647.531242 | 1.189 |
| 5657.278555 | 1.183 |
| 5667.024703 | 1.177 |
| 5677.51925 | 1.172 |
| 5687.262972 | 1.167 |
| 5697.005523 | 1.161 |
| 5707.496189 | 1.156 |
| 5717.236302 | 1.151 |
| 5726.975237 | 1.145 |
| 5737.462002 | 1.14 |
| 5747.198485 | 1.135 |
| 5757.682605 | 1.13 |
| 5767.416629 | 1.125 |
| 5777.149464 | 1.12 |
| 5787.629649 | 1.115 |
| 5797.360012 | 1.11 |
| 5807.08918 | 1.105 |
| 5817.565409 | 1.1 |
| 5827.292092 | 1.096 |
| 5837.017575 | 1.091 |
| 5847.489828 | 1.086 |
| 5857.212813 | 1.082 |
| 5866.934591 | 1.077 |
| 5877.402847 | 1.072 |
| 5887.122114 | 1.068 |
| 5897.587661 | 1.063 |
| 5907.304408 | 1.059 |
| 5917.019938 | 1.055 |
| 5927.481454 | 1.05 |
| 5937.194452 | 1.046 |
| 5946.906226 | 1.042 |
| 5957.363691 | 1.037 |
| 5967.072921 | 1.033 |
| 5977.52764 | 1.029 |
| 5987.234315 | 1.025 |
| 5996.939757 | 1.021 |
| 6007.39039 | 1.016 |
| 6017.093265 | 1.012 |
| 6026.794901 | 1.008 |
| 6037.241429 | 1.004 |
| 6046.940485 | 1 |
| 6057.38423 | 0.996 |
| 6067.080698 | 0.992 |
| 6076.775917 | 0.989 |
| 6087.215522 | 0.985 |
| 6096.908139 | 0.981 |
| 6107.344938 | 0.977 |
| 6117.034946 | 0.973 |
| 6126.723694 | 0.97 |
| 6137.156319 | 0.966 |
| 6146.842444 | 0.962 |
| 6157.272241 | 0.959 |
| 6166.955735 | 0.955 |
| 6177.382693 | 0.951 |
| 6187.063548 | 0.948 |
| 6196.743128 | 0.944 |
| 6207.165865 | 0.941 |
| 6216.842793 | 0.937 |
| 6227.262668 | 0.934 |
| 6236.936935 | 0.931 |
| 6246.609918 | 0.927 |
| 6257.025537 | 0.924 |
| 6266.695846 | 0.92 |
| 6277.108582 | 0.917 |
| 6286.776208 | 0.914 |
| 6297.18605 | 0.911 |
| 6306.850986 | 0.907 |
| 6317.257926 | 0.904 |
| 6326.920162 | 0.901 |
| 6336.581095 | 0.898 |
| 6346.983717 | 0.894 |
| 6356.641938 | 0.891 |
| 6367.041635 | 0.888 |
| 6376.697135 | 0.885 |
| 6387.093897 | 0.882 |
| 6396.746668 | 0.879 |
| 6407.140486 | 0.876 |
| 6416.790518 | 0.873 |
| 6427.181383 | 0.87 |
| 6436.828669 | 0.867 |
| 6446.47463 | 0.864 |
| 6456.861103 | 0.861 |
| 6466.504304 | 0.858 |
| 6476.8878 | 0.855 |
| 6486.528234 | 0.852 |
| 6496.908745 | 0.85 |
| 6506.546402 | 0.847 |
| 6516.923919 | 0.844 |
| 6526.558791 | 0.841 |
| 6536.933304 | 0.838 |
| 6546.565382 | 0.836 |
| 6556.936882 | 0.833 |
| 6566.566159 | 0.83 |
| 6576.934637 | 0.828 |
| 6586.561102 | 0.825 |
| 6596.926549 | 0.822 |
| 6606.550195 | 0.82 |
| 6616.912601 | 0.817 |
| 6626.53342 | 0.814 |
| 6636.892776 | 0.812 |
| 6646.510758 | 0.809 |
| 6656.867055 | 0.807 |
| 6666.482193 | 0.804 |
| 6676.835422 | 0.802 |
| 6686.447706 | 0.799 |
| 6696.797857 | 0.797 |
| 6706.40728 | 0.794 |
| 6716.754344 | 0.792 |
| 6726.360896 | 0.789 |
| 6736.704865 | 0.787 |
| 6746.308538 | 0.784 |
| 6756.649402 | 0.782 |
| 6766.250188 | 0.779 |
| 6776.587937 | 0.777 |
| 6786.924068 | 0.775 |
| 6796.520453 | 0.772 |
| 6806.853456 | 0.77 |
| 6816.446931 | 0.768 |
| 6826.776797 | 0.765 |
| 6836.367355 | 0.763 |
| 6846.694074 | 0.761 |
| 6856.281707 | 0.758 |
| 6866.60527 | 0.756 |
| 6876.189968 | 0.754 |
| 6886.510366 | 0.752 |
| 6896.82912 | 0.75 |
| 6906.409345 | 0.747 |
| 6916.724921 | 0.745 |
| 6926.30219 | 0.743 |
| 6936.614577 | 0.741 |
| 6946.188882 | 0.739 |
| 6956.498072 | 0.736 |
| 6966.805601 | 0.734 |
| 6976.375388 | 0.732 |
| 6986.679706 | 0.73 |
| 6996.246507 | 0.728 |
| 7006.547605 | 0.726 |
| 7016.111412 | 0.724 |
| 7026.40928 | 0.722 |
| 7036.70547 | 0.72 |
| 7046.264714 | 0.718 |
| 7056.557661 | 0.716 |
| 7066.113889 | 0.714 |
| 7076.403584 | 0.712 |
| 7086.691589 | 0.71 |
| 7096.243221 | 0.708 |
| 7106.527959 | 0.706 |
| 7116.076554 | 0.704 |
| 7126.358018 | 0.702 |
| 7136.637779 | 0.7 |
| 7146.181746 | 0.698 |
| 7156.458218 | 0.696 |
| 7165.999126 | 0.694 |
| 7176.2723 | 0.692 |
| 7186.54376 | 0.69 |
| 7196.080008 | 0.688 |
| 7206.348156 | 0.687 |
| 7216.614582 | 0.685 |
| 7226.14615 | 0.683 |
| 7236.409251 | 0.681 |
| 7245.937725 | 0.679 |
| 7256.197491 | 0.677 |
| 7266.455524 | 0.676 |
| 7275.979286 | 0.674 |
| 7286.23397 | 0.672 |
| 7296.486914 | 0.67 |
| 7306.005944 | 0.669 |
| 7316.255525 | 0.667 |
| 7326.503358 | 0.665 |
| 7336.017637 | 0.663 |
| 7346.262094 | 0.662 |
| 7356.504797 | 0.66 |
| 7366.014304 | 0.658 |
| 7376.253616 | 0.656 |
| 7386.491167 | 0.655 |
| 7395.995884 | 0.653 |
| 7406.23003 | 0.651 |
| 7416.462408 | 0.65 |
| 7425.962315 | 0.648 |
| 7436.191274 | 0.647 |
| 7446.418458 | 0.645 |
| 7455.913536 | 0.643 |
| 7466.137287 | 0.642 |
| 7476.359256 | 0.64 |
| 7485.849485 | 0.638 |
| 7496.068008 | 0.637 |
| 7506.284741 | 0.635 |
| 7515.770101 | 0.634 |
| 7525.983375 | 0.632 |
| 7536.19485 | 0.631 |
| 7545.675324 | 0.629 |
| 7555.883326 | 0.627 |
| 7566.089524 | 0.626 |
| 7576.293916 | 0.624 |
| 7585.767802 | 0.623 |
| 7595.968701 | 0.621 |
| 7606.167786 | 0.62 |
| 7615.636739 | 0.618 |
| 7625.832319 | 0.617 |
| 7636.026078 | 0.615 |
| 7646.218013 | 0.614 |
| 7655.680318 | 0.612 |
| 7665.868729 | 0.611 |
| 7676.05531 | 0.61 |
| 7686.240057 | 0.608 |
| 7695.695679 | 0.607 |
| 7705.876884 | 0.605 |
| 7716.056248 | 0.604 |
| 7726.23377 | 0.602 |
| 7735.682674 | 0.601 |
| 7745.856636 | 0.6 |
| 7756.028747 | 0.598 |
| 7766.199006 | 0.597 |
| 7775.641157 | 0.595 |
| 7785.807837 | 0.594 |
| 7795.972657 | 0.593 |
| 7806.135616 | 0.591 |
| 7815.57098 | 0.59 |
| 7825.730341 | 0.589 |
| 7835.887833 | 0.587 |
| 7846.043454 | 0.586 |
| 7855.471995 | 0.585 |
| 7865.624 | 0.583 |
| 7875.774127 | 0.582 |
| 7885.922372 | 0.581 |
| 7896.068734 | 0.579 |
| 7905.488668 | 0.578 |
| 7915.631391 | 0.577 |
| 7925.772224 | 0.576 |
| 7935.911164 | 0.574 |
| 7946.048209 | 0.573 |
| 7955.45948 | 0.572 |
| 7965.592863 | 0.57 |
| 7975.724343 | 0.569 |
| 7985.853919 | 0.568 |
| 7995.981587 | 0.567 |
| 8005.384141 | 0.565 |
| 8015.508125 | 0.564 |
| 8025.630194 | 0.563 |
| 8035.750346 | 0.562 |
| 8045.86858 | 0.561 |
| 8055.984892 | 0.559 |
| 8065.376887 | 0.558 |
| 8075.489487 | 0.557 |
| 8085.600158 | 0.556 |
| 8095.708897 | 0.555 |
| 8105.815704 | 0.553 |
| 8115.920574 | 0.552 |
| 8125.301933 | 0.551 |
| 8135.403063 | 0.55 |
| 8145.502251 | 0.549 |
| 8155.599493 | 0.547 |
| 8165.694787 | 0.546 |
| 8175.788131 | 0.545 |
| 8185.879523 | 0.544 |
| 8195.248351 | 0.543 |
| 8205.33597 | 0.542 |
| 8215.42163 | 0.541 |
| 8225.505327 | 0.539 |
| 8235.587061 | 0.538 |
| 8245.666827 | 0.537 |
| 8255.744624 | 0.536 |
| 8265.82045 | 0.535 |
| 8275.174806 | 0.534 |
| 8285.246822 | 0.533 |
| 8295.31686 | 0.532 |
| 8305.384917 | 0.531 |
| 8315.45099 | 0.529 |
| 8325.515077 | 0.528 |
| 8335.577176 | 0.527 |
| 8345.637284 | 0.526 |
| 8355.695399 | 0.525 |
| 8365.751519 | 0.524 |
| 8375.087555 | 0.523 |
| 8385.139819 | 0.522 |
| 8395.190081 | 0.521 |
| 8405.238338 | 0.52 |
| 8415.284587 | 0.519 |
| 8425.328827 | 0.518 |
| 8435.371055 | 0.517 |
| 8445.411268 | 0.516 |
| 8455.449464 | 0.515 |
| 8465.485641 | 0.514 |
| 8475.519796 | 0.513 |
| 8485.551927 | 0.512 |
| 8495.582031 | 0.511 |
| 8505.610107 | 0.51 |
| 8515.636151 | 0.509 |
| 8525.660162 | 0.508 |
| 8535.682136 | 0.507 |
| 8544.98643 | 0.506 |
| 8555.004471 | 0.505 |
| 8565.020468 | 0.504 |
| 8575.034421 | 0.503 |
| 8585.046325 | 0.502 |
| 8595.056179 | 0.501 |
| 8605.063981 | 0.5 |
| 8615.069727 | 0.499 |
| 8625.073416 | 0.498 |
| 8635.075045 | 0.497 |
| 8645.074612 | 0.496 |
| 8655.072114 | 0.495 |
| 8665.067549 | 0.494 |
| 8675.060915 | 0.493 |
| 8685.052209 | 0.492 |
| 8695.041429 | 0.491 |
| 8705.028573 | 0.49 |
| 8715.013637 | 0.49 |
| 8724.99662 | 0.489 |
| 8734.977519 | 0.488 |
| 8744.956333 | 0.487 |
| 8754.933058 | 0.486 |
| 8764.907692 | 0.485 |
| 8774.880232 | 0.484 |
| 8784.850677 | 0.483 |
| 8794.819025 | 0.482 |
| 8804.785271 | 0.481 |
| 8815.461059 | 0.481 |
| 8825.422948 | 0.48 |
| 8835.382728 | 0.479 |
| 8845.340399 | 0.478 |
| 8855.295957 | 0.477 |
| 8865.249401 | 0.476 |
| 8875.200727 | 0.475 |
| 8885.149933 | 0.474 |
| 8895.097018 | 0.474 |
| 8905.041978 | 0.473 |
| 8914.984812 | 0.472 |
| 8924.925517 | 0.471 |
| 8934.86409 | 0.47 |
| 8944.800529 | 0.469 |
| 8954.734832 | 0.469 |
| 8965.376355 | 0.468 |
| 8975.306225 | 0.467 |
| 8985.233952 | 0.466 |
| 8995.159534 | 0.465 |
| 9005.082967 | 0.465 |
| 9015.004249 | 0.464 |
| 9024.923378 | 0.463 |
| 9034.840353 | 0.462 |
| 9044.755169 | 0.461 |
| 9054.667825 | 0.46 |
| 9065.286129 | 0.46 |
| 9075.194303 | 0.459 |
| 9085.10031 | 0.458 |
| 9095.004147 | 0.457 |
| 9104.905813 | 0.456 |
| 9114.805303 | 0.456 |
| 9124.702617 | 0.455 |
| 9134.597752 | 0.454 |
| 9145.197262 | 0.453 |
| 9155.087875 | 0.453 |
| 9164.976302 | 0.452 |
| 9174.86254 | 0.451 |
| 9184.746587 | 0.45 |
| 9194.628441 | 0.45 |
| 9204.508098 | 0.449 |
| 9215.091006 | 0.448 |
| 9224.966108 | 0.447 |
| 9234.839006 | 0.447 |
| 9244.709699 | 0.446 |
| 9254.578185 | 0.445 |
| 9265.149109 | 0.444 |
| 9275.013013 | 0.444 |
| 9284.874702 | 0.443 |
| 9294.734174 | 0.442 |
| 9304.591426 | 0.441 |
| 9314.446456 | 0.441 |
| 9325.002949 | 0.44 |
| 9334.853368 | 0.439 |
| 9344.701558 | 0.438 |
| 9354.547517 | 0.438 |
| 9364.391241 | 0.437 |
| 9374.935607 | 0.436 |
| 9384.774696 | 0.436 |
| 9394.611544 | 0.435 |
| 9404.446148 | 0.434 |
| 9414.980732 | 0.433 |
| 9424.810682 | 0.433 |
| 9434.63838 | 0.432 |
| 9444.463825 | 0.431 |
| 9454.988585 | 0.431 |
| 9464.809356 | 0.43 |
| 9474.627866 | 0.429 |
| 9484.444114 | 0.428 |
| 9494.959008 | 0.428 |
| 9504.770561 | 0.427 |
| 9514.579844 | 0.426 |
| 9524.386855 | 0.426 |
| 9534.891842 | 0.425 |
| 9544.694139 | 0.424 |
| 9554.494156 | 0.424 |
| 9564.291891 | 0.423 |
| 9574.786929 | 0.422 |
| 9584.57993 | 0.422 |
| 9594.370643 | 0.421 |
| 9604.858149 | 0.42 |
| 9614.644112 | 0.42 |
| 9624.427779 | 0.419 |
| 9634.209147 | 0.418 |
| 9644.686632 | 0.418 |
| 9654.463232 | 0.417 |
| 9664.237526 | 0.416 |
| 9674.707423 | 0.416 |
| 9684.476934 | 0.415 |
| 9694.244132 | 0.414 |
| 9704.706417 | 0.414 |
| 9714.468817 | 0.413 |
| 9724.228897 | 0.412 |
| 9734.683548 | 0.412 |
| 9744.438814 | 0.411 |
| 9754.191753 | 0.411 |
| 9764.638746 | 0.41 |
| 9774.386857 | 0.409 |
| 9784.132634 | 0.409 |
| 9794.571945 | 0.408 |
| 9804.312879 | 0.407 |
| 9814.746996 | 0.407 |
| 9824.483078 | 0.406 |
| 9834.216813 | 0.406 |
| 9844.643209 | 0.405 |
| 9854.372076 | 0.404 |
| 9864.09859 | 0.404 |
| 9874.517241 | 0.403 |
| 9884.238873 | 0.403 |
| 9894.652288 | 0.402 |
| 9904.369027 | 0.401 |
| 9914.083402 | 0.401 |
| 9924.489032 | 0.4 |
| 9934.198499 | 0.399 |
| 9944.598867 | 0.399 |
| 9954.303417 | 0.398 |
| 9964.00559 | 0.398 |
| 9974.398135 | 0.397 |
| 9984.095376 | 0.397 |
| 9994.482631 | 0.396 |
| 10004.17493 | 0.395 |
| 10014.55689 | 0.395 |
| 10024.24423 | 0.394 |
| 10033.92919 | 0.394 |
| 10044.30326 | 0.393 |
| 10053.98325 | 0.392 |
| 10064.352 | 0.392 |
| 10074.02701 | 0.391 |
| 10084.39043 | 0.391 |
| 10094.06045 | 0.39 |
| 10104.41852 | 0.39 |
| 10114.08355 | 0.389 |
| 10124.43625 | 0.388 |
| 10134.09628 | 0.388 |
| 10144.44362 | 0.387 |
| 10154.09862 | 0.387 |
| 10164.44058 | 0.386 |
| 10174.09056 | 0.386 |
| 10184.42713 | 0.385 |
| 10194.07208 | 0.385 |
| 10204.40325 | 0.384 |
| 10214.04315 | 0.384 |
| 10224.36891 | 0.383 |
| 10234.00375 | 0.382 |
| 10244.32409 | 0.382 |
| 10253.95386 | 0.381 |
| 10264.26877 | 0.381 |
| 10273.89347 | 0.38 |
| 10284.20293 | 0.38 |
| 10293.82255 | 0.379 |
| 10304.12656 | 0.379 |
| 10313.74108 | 0.378 |
| 10324.03963 | 0.378 |
| 10334.33534 | 0.377 |
| 10343.94211 | 0.376 |
| 10354.23234 | 0.376 |
| 10363.834 | 0.375 |
| 10374.11874 | 0.375 |
| 10383.71527 | 0.374 |
| 10393.99451 | 0.374 |
| 10404.2709 | 0.373 |
| 10413.85962 | 0.373 |
| 10424.1305 | 0.372 |
| 10433.71407 | 0.372 |
| 10443.97941 | 0.371 |
| 10454.2419 | 0.371 |
| 10463.81763 | 0.37 |
| 10474.07457 | 0.37 |
| 10483.64512 | 0.369 |
| 10493.8965 | 0.369 |
| 10504.14501 | 0.368 |
| 10513.70769 | 0.368 |
| 10523.95063 | 0.367 |
| 10534.19068 | 0.367 |
| 10543.74545 | 0.366 |
| 10553.97992 | 0.366 |
| 10564.21149 | 0.365 |
| 10573.75835 | 0.365 |
| 10583.98432 | 0.364 |
| 10593.52594 | 0.364 |
| 10603.7463 | 0.363 |
| 10613.96375 | 0.363 |
| 10624.17829 | 0.362 |
| 10633.70924 | 0.362 |
| 10643.91815 | 0.361 |
| 10654.12414 | 0.361 |
| 10663.64709 | 0.361 |
| 10673.84743 | 0.36 |
| 10684.04485 | 0.36 |
| 10693.55979 | 0.359 |
| 10703.75154 | 0.359 |
| 10713.94035 | 0.358 |
| 10723.44726 | 0.358 |
| 10733.6304 | 0.357 |
| 10743.81059 | 0.357 |
| 10753.98783 | 0.356 |
| 10763.48393 | 0.356 |
| 10773.65548 | 0.355 |
| 10783.82407 | 0.355 |
| 10793.9897 | 0.355 |
| 10803.47495 | 0.354 |
| 10813.63486 | 0.354 |
| 10823.7918 | 0.353 |
| 10833.94578 | 0.353 |
| 10843.42014 | 0.352 |
| 10853.56838 | 0.352 |
| 10863.71363 | 0.351 |
| 10873.85591 | 0.351 |
| 10883.31935 | 0.351 |
| 10893.45586 | 0.35 |
| 10903.58938 | 0.35 |
| 10913.71992 | 0.349 |
| 10923.84746 | 0.349 |
| 10933.29714 | 0.348 |
| 10943.41889 | 0.348 |
| 10953.53764 | 0.348 |
| 10963.65339 | 0.347 |
| 10973.76613 | 0.347 |
| 10983.87586 | 0.346 |
| 10993.3089 | 0.346 |
| 11003.41281 | 0.345 |
| 11013.5137 | 0.345 |
| 11023.61157 | 0.345 |
| 11033.70642 | 0.344 |
| 11043.79825 | 0.344 |
| 11053.21456 | 0.343 |
| 11063.30053 | 0.343 |
| 11073.38346 | 0.343 |
| 11083.46337 | 0.342 |
| 11093.54023 | 0.342 |
| 11103.61405 | 0.341 |
| 11113.68483 | 0.341 |
| 11123.75256 | 0.34 |
| 11133.14635 | 0.34 |
| 11143.20819 | 0.34 |
| 11153.26696 | 0.339 |
| 11163.32268 | 0.339 |
| 11173.37534 | 0.338 |
| 11183.42494 | 0.338 |
| 11193.47147 | 0.338 |
| 11203.51493 | 0.337 |
| 11213.55532 | 0.337 |
| 11223.59263 | 0.337 |
| 11233.62687 | 0.336 |
| 11243.65803 | 0.336 |
| 11253.6861 | 0.335 |
| 11263.71109 | 0.335 |
| 11273.06496 | 0.335 |
| 11283.08398 | 0.334 |
| 11293.09991 | 0.334 |
| 11303.11274 | 0.333 |
| 11313.12247 | 0.333 |
| 11323.12909 | 0.333 |
| 11333.13262 | 0.332 |
| 11343.13303 | 0.332 |
| 11353.13034 | 0.332 |
| 11363.12453 | 0.331 |
| 11373.11561 | 0.331 |
| 11383.10358 | 0.33 |
| 11393.08842 | 0.33 |
| 11403.07013 | 0.33 |
| 11413.04872 | 0.329 |
| 11423.02418 | 0.329 |
| 11432.99651 | 0.329 |
| 11442.96571 | 0.328 |
| 11452.93177 | 0.328 |
| 11463.55877 | 0.327 |
| 11473.51834 | 0.327 |
| 11483.47476 | 0.327 |
| 11493.42803 | 0.326 |
| 11503.37815 | 0.326 |
| 11513.32512 | 0.325 |
| 11523.26893 | 0.325 |
| 11533.20958 | 0.325 |
| 11543.14707 | 0.324 |
| 11553.0814 | 0.324 |
| 11563.01256 | 0.324 |
| 11572.94055 | 0.323 |
| 11582.86536 | 0.323 |
| 11593.44833 | 0.323 |
| 11603.36658 | 0.322 |
| 11613.28165 | 0.322 |
| 11623.19353 | 0.321 |
| 11633.10223 | 0.321 |
| 11643.00774 | 0.321 |
| 11652.91006 | 0.32 |
| 11662.80918 | 0.32 |
| 11673.36472 | 0.32 |
| 11683.25723 | 0.319 |
| 11693.14654 | 0.319 |
| 11703.03264 | 0.319 |
| 11712.91554 | 0.318 |
| 11722.79522 | 0.318 |
| 11733.33001 | 0.318 |
| 11743.20304 | 0.317 |
| 11753.07286 | 0.317 |
| 11762.93946 | 0.317 |
| 11772.80283 | 0.316 |
| 11783.3202 | 0.316 |
| 11793.1769 | 0.316 |
| 11803.03036 | 0.315 |
| 11812.88059 | 0.315 |
| 11822.72758 | 0.315 |
| 11833.22747 | 0.314 |
| 11843.06776 | 0.314 |
| 11852.9048 | 0.314 |
| 11862.73859 | 0.313 |
| 11873.22439 | 0.313 |
| 11883.05145 | 0.313 |
| 11892.87526 | 0.312 |
| 11902.69581 | 0.312 |
| 11913.16747 | 0.311 |
| 11922.98127 | 0.311 |
| 11932.79181 | 0.311 |
| 11942.59907 | 0.31 |
| 11953.05654 | 0.31 |
| 11962.85704 | 0.31 |
| 11972.65425 | 0.309 |
| 11983.10099 | 0.309 |
| 11992.89142 | 0.309 |
| 12002.67856 | 0.308 |
| 12013.11455 | 0.308 |
| 12022.89488 | 0.308 |
| 12032.67192 | 0.307 |
| 12043.09713 | 0.307 |
| 12052.86735 | 0.307 |
| 12062.63426 | 0.306 |
| 12073.04866 | 0.306 |
| 12082.80874 | 0.306 |
| 12092.5655 | 0.306 |
| 12102.96906 | 0.305 |
| 12112.71897 | 0.305 |
| 12122.46556 | 0.305 |
| 12132.85826 | 0.304 |
| 12142.59798 | 0.304 |
| 12152.98334 | 0.304 |
| 12162.71618 | 0.303 |
| 12172.44568 | 0.303 |
| 12182.82013 | 0.303 |
| 12192.54273 | 0.302 |
| 12202.90982 | 0.302 |
| 12212.62551 | 0.302 |
| 12222.98523 | 0.301 |
| 12232.69399 | 0.301 |
| 12242.39941 | 0.301 |
| 12252.74815 | 0.301 |
| 12262.44662 | 0.3 |
| 12272.78796 | 0.3 |
| 12282.47948 | 0.3 |
| 12292.81339 | 0.299 |
| 12302.49796 | 0.299 |
| 12312.82444 | 0.299 |
| 12322.50203 | 0.298 |
| 12332.82106 | 0.298 |
| 12342.49167 | 0.298 |
| 12352.80325 | 0.298 |
| 12362.46686 | 0.297 |
| 12372.77097 | 0.297 |
| 12382.42757 | 0.297 |
| 12392.7242 | 0.296 |
| 12402.37378 | 0.296 |
| 12412.66292 | 0.296 |
| 12422.30547 | 0.296 |
| 12432.58711 | 0.295 |
| 12442.22262 | 0.295 |
| 12452.49673 | 0.295 |
| 12462.76697 | 0.294 |
| 12472.39178 | 0.294 |
| 12482.65448 | 0.294 |
| 12492.27222 | 0.294 |
| 12502.52738 | 0.293 |
| 12512.77863 | 0.293 |
| 12522.38563 | 0.293 |
| 12532.62932 | 0.293 |
| 12542.22922 | 0.292 |
| 12552.46533 | 0.292 |
| 12562.69753 | 0.292 |
| 12572.28665 | 0.291 |
| 12582.51125 | 0.291 |
| 12592.73192 | 0.291 |
| 12602.31024 | 0.291 |
| 12612.5233 | 0.29 |
| 12622.09447 | 0.29 |
| 12632.29991 | 0.29 |
| 12642.5014 | 0.29 |
| 12652.69895 | 0.289 |
| 12662.25557 | 0.289 |
| 12672.44547 | 0.289 |
| 12682.63142 | 0.289 |
| 12692.17715 | 0.288 |
| 12702.35544 | 0.288 |
| 12712.52975 | 0.288 |
| 12722.06458 | 0.288 |
| 12732.23121 | 0.287 |
| 12742.39387 | 0.287 |
| 12752.55256 | 0.287 |
| 12762.07271 | 0.287 |
| 12772.22369 | 0.286 |
| 12782.37068 | 0.286 |
| 12792.51369 | 0.286 |
| 12802.01913 | 0.286 |
| 12812.1544 | 0.285 |
| 12822.28568 | 0.285 |
| 12832.41295 | 0.285 |
| 12842.53622 | 0.285 |
| 12852.02315 | 0.284 |
| 12862.13866 | 0.284 |
| 12872.25016 | 0.284 |
| 12882.35764 | 0.284 |
| 12892.4611 | 0.283 |
| 12901.92944 | 0.283 |
| 12912.02511 | 0.283 |
| 12922.11675 | 0.283 |
| 12932.20436 | 0.283 |
| 12942.28794 | 0.282 |
| 12952.36747 | 0.282 |
| 12962.44297 | 0.282 |
| 12971.88508 | 0.282 |
| 12981.95274 | 0.282 |
| 12992.01635 | 0.281 |
| 13002.07591 | 0.281 |
| 13012.13141 | 0.281 |
| 13022.18286 | 0.281 |
| 13032.23024 | 0.28 |
| 13042.27356 | 0.28 |
| 13052.31281 | 0.28 |
| 13062.34799 | 0.28 |
| 13072.37909 | 0.28 |
| 13081.77955 | 0.279 |
| 13091.80275 | 0.279 |
| 13101.82186 | 0.279 |
| 13111.83689 | 0.279 |
| 13121.84783 | 0.279 |
| 13131.85468 | 0.279 |
| 13141.85743 | 0.278 |
| 13151.85608 | 0.278 |
| 13161.85063 | 0.278 |
| 13171.84107 | 0.278 |
| 13181.8274 | 0.278 |
| 13191.80963 | 0.277 |
| 13201.78774 | 0.277 |
| 13211.76172 | 0.277 |
| 13221.73159 | 0.277 |
| 13231.69734 | 0.277 |
| 13241.65895 | 0.276 |
| 13252.23865 | 0.276 |
| 13262.19174 | 0.276 |
| 13272.1407 | 0.276 |
| 13282.08552 | 0.276 |
| 13292.02619 | 0.275 |
| 13301.96272 | 0.275 |
| 13311.8951 | 0.275 |
| 13321.82333 | 0.275 |
| 13331.7474 | 0.275 |
| 13341.66731 | 0.274 |
| 13351.58306 | 0.274 |
| 13362.11398 | 0.274 |
| 13372.02114 | 0.274 |
| 13381.92413 | 0.274 |
| 13391.82294 | 0.274 |
| 13401.71758 | 0.273 |
| 13411.60803 | 0.273 |
| 13422.11206 | 0.273 |
| 13431.99388 | 0.273 |
| 13441.87151 | 0.273 |
| 13451.74495 | 0.273 |
| 13461.6142 | 0.272 |
| 13472.09567 | 0.272 |
| 13481.95625 | 0.272 |
| 13491.81263 | 0.272 |
| 13501.66479 | 0.272 |
| 13511.51275 | 0.272 |
| 13521.97158 | 0.271 |
| 13531.81084 | 0.271 |
| 13541.64588 | 0.271 |
| 13551.47669 | 0.271 |
| 13561.9173 | 0.271 |
| 13571.7394 | 0.271 |
| 13581.55725 | 0.271 |
| 13591.98409 | 0.27 |
| 13601.79321 | 0.27 |
| 13611.59808 | 0.27 |
| 13621.39871 | 0.27 |
| 13631.80722 | 0.27 |
| 13641.59909 | 0.27 |
| 13651.38669 | 0.269 |
| 13661.78136 | 0.269 |
| 13671.56018 | 0.269 |
| 13681.94551 | 0.269 |
| 13691.71553 | 0.269 |
| 13701.48128 | 0.269 |
| 13711.85271 | 0.269 |
| 13721.60964 | 0.269 |
| 13731.3623 | 0.268 |
| 13741.7198 | 0.268 |
| 13751.46361 | 0.268 |
| 13761.81172 | 0.268 |
| 13771.54668 | 0.268 |
| 13781.88538 | 0.268 |
| 13791.61148 | 0.268 |
| 13801.33328 | 0.267 |
| 13811.65798 | 0.267 |
| 13821.37089 | 0.267 |
| 13831.68615 | 0.267 |
| 13841.39017 | 0.267 |
| 13851.69596 | 0.267 |
| 13861.39108 | 0.266 |
| 13871.6874 | 0.266 |
| 13881.37359 | 0.266 |
| 13891.66043 | 0.266 |
| 13901.33769 | 0.266 |
| 13911.61502 | 0.265 |
| 13921.28334 | 0.265 |
| 13931.55116 | 0.265 |
| 13941.21051 | 0.265 |
| 13951.46881 | 0.265 |
| 13961.72219 | 0.264 |
| 13971.36795 | 0.264 |
| 13981.61179 | 0.264 |
| 13991.24855 | 0.264 |
| 14001.48283 | 0.264 |
| 14011.71217 | 0.263 |
| 14021.33529 | 0.263 |
| 14031.55505 | 0.263 |
| 14041.16914 | 0.263 |
| 14051.37931 | 0.263 |
| 14061.58453 | 0.262 |
| 14071.18493 | 0.262 |
| 14081.38053 | 0.262 |
| 14091.57118 | 0.262 |
| 14101.15785 | 0.262 |
| 14111.33886 | 0.261 |
| 14121.51491 | 0.261 |
| 14131.08782 | 0.261 |
| 14141.25421 | 0.261 |
| 14151.41561 | 0.261 |
| 14161.57204 | 0.261 |
| 14171.12647 | 0.26 |
| 14181.27321 | 0.26 |
| 14191.41496 | 0.26 |
| 14201.55171 | 0.26 |
| 14211.08762 | 0.26 |
| 14221.21466 | 0.26 |
| 14231.33669 | 0.26 |
| 14241.45371 | 0.26 |
| 14250.97103 | 0.26 |
| 14261.07831 | 0.259 |
| 14271.18057 | 0.259 |
| 14281.27781 | 0.259 |
| 14291.37001 | 0.259 |
| 14301.45718 | 0.259 |
| 14310.94639 | 0.259 |
| 14321.02379 | 0.258 |
| 14331.09614 | 0.258 |
| 14341.16344 | 0.258 |
| 14351.2257 | 0.258 |
| 14361.2829 | 0.258 |
| 14371.33504 | 0.258 |
| 14381.38213 | 0.258 |
| 14391.42415 | 0.258 |
| 14400.87083 | 0.258 |
| 14410.90301 | 0.258 |
| 14420.93011 | 0.258 |
| 14430.95214 | 0.258 |
| 14440.96908 | 0.258 |
| 14450.98094 | 0.258 |
| 14460.98771 | 0.258 |
| 14470.98939 | 0.258 |
| 14480.98597 | 0.257 |
| 14490.97745 | 0.257 |
| 14500.96383 | 0.257 |
| 14510.9451 | 0.257 |
| 14520.92127 | 0.257 |
| 14530.89232 | 0.257 |
| 14540.85825 | 0.257 |
| 14550.81906 | 0.257 |
| 14560.77475 | 0.257 |
| 14571.31048 | 0.257 |
| 14581.25561 | 0.258 |
| 14591.19561 | 0.257 |
| 14601.13046 | 0.257 |
| 14611.06018 | 0.257 |
| 14620.98475 | 0.257 |
| 14630.90417 | 0.257 |
| 14640.81844 | 0.257 |
| 14650.72755 | 0.257 |
| 14661.21393 | 0.257 |
| 14671.11242 | 0.257 |
| 14681.00574 | 0.257 |
| 14690.89389 | 0.257 |
| 14700.77687 | 0.257 |
| 14710.65467 | 0.257 |
| 14721.10787 | 0.257 |
| 14730.975 | 0.257 |
| 14740.83695 | 0.257 |
| 14750.6937 | 0.257 |
| 14761.12461 | 0.257 |
| 14770.97066 | 0.257 |
| 14780.81152 | 0.257 |
| 14790.64717 | 0.257 |
| 14801.05571 | 0.258 |
| 14810.88064 | 0.258 |
| 14820.70034 | 0.258 |
| 14831.09199 | 0.258 |
| 14840.90095 | 0.258 |
| 14850.70469 | 0.258 |
| 14861.07941 | 0.258 |
| 14870.87237 | 0.258 |
| 14880.6601 | 0.258 |
| 14891.01786 | 0.258 |
| 14900.7948 | 0.258 |
| 14910.56649 | 0.258 |
| 14920.90726 | 0.258 |
| 14930.66813 | 0.258 |
| 14940.99744 | 0.258 |
| 14950.74749 | 0.258 |
| 14960.49227 | 0.258 |
| 14970.80453 | 0.258 |
| 14980.53846 | 0.258 |
| 14990.83922 | 0.258 |
| 15000.56229 | 0.258 |
| 15010.85154 | 0.258 |
| 15020.56373 | 0.258 |
| 15030.84146 | 0.258 |
| 15040.54275 | 0.258 |
| 15050.80894 | 0.258 |
| 15060.49932 | 0.258 |
| 15070.75395 | 0.258 |
| 15080.43342 | 0.258 |
| 15090.67647 | 0.258 |
| 15100.91357 | 0.258 |
| 15110.57647 | 0.258 |
| 15120.80197 | 0.258 |
| 15130.45391 | 0.258 |
| 15140.6678 | 0.258 |
| 15150.87571 | 0.258 |
| 15160.51103 | 0.258 |
| 15170.70731 | 0.257 |
| 15180.33163 | 0.257 |
| 15190.51626 | 0.257 |
| 15200.69489 | 0.257 |
| 15210.30253 | 0.257 |
| 15220.4695 | 0.257 |
| 15230.63045 | 0.257 |
| 15240.78539 | 0.257 |
| 15250.37064 | 0.257 |
| 15260.51388 | 0.257 |
| 15270.65109 | 0.257 |
| 15280.78227 | 0.256 |
| 15290.34507 | 0.256 |
| 15300.46452 | 0.256 |
| 15310.57793 | 0.256 |
| 15320.6853 | 0.256 |
| 15330.22559 | 0.256 |
| 15340.32119 | 0.256 |
| 15350.41073 | 0.255 |
| 15360.49422 | 0.255 |
| 15370.57164 | 0.255 |
| 15380.64299 | 0.255 |
| 15390.70827 | 0.255 |
| 15400.20879 | 0.254 |
| 15410.26225 | 0.254 |
| 15420.30963 | 0.254 |
| 15430.35092 | 0.254 |
| 15440.38612 | 0.254 |
| 15450.41522 | 0.253 |
| 15460.43823 | 0.253 |
| 15470.45513 | 0.253 |
| 15480.46592 | 0.253 |
| 15490.4706 | 0.253 |
| 15500.46917 | 0.253 |
| 15510.46161 | 0.252 |
| 15520.44794 | 0.252 |
| 15530.42813 | 0.252 |
| 15540.4022 | 0.252 |
| 15550.37013 | 0.252 |
| 15560.33192 | 0.252 |
| 15570.28757 | 0.251 |
| 15580.23707 | 0.251 |
| 15590.18042 | 0.251 |
| 15600.11761 | 0.251 |
| 15610.04865 | 0.251 |
| 15620.52472 | 0.251 |
| 15630.44309 | 0.25 |
| 15640.35528 | 0.25 |
| 15650.2613 | 0.25 |
| 15660.16114 | 0.25 |
| 15670.0548 | 0.25 |
| 15680.4914 | 0.25 |
| 15690.37234 | 0.249 |
| 15700.24708 | 0.249 |
| 15710.11563 | 0.249 |
| 15719.97797 | 0.249 |
| 15730.38149 | 0.249 |
| 15740.23107 | 0.249 |
| 15750.07444 | 0.249 |
| 15759.91159 | 0.248 |
| 15770.2885 | 0.248 |
| 15780.11286 | 0.248 |
| 15789.93098 | 0.248 |
| 15800.2878 | 0.248 |
| 15810.09311 | 0.248 |
| 15819.89218 | 0.248 |
| 15830.22886 | 0.248 |
| 15840.01509 | 0.248 |
| 15850.33821 | 0.247 |
| 15860.11158 | 0.247 |
| 15869.87869 | 0.247 |
| 15880.18161 | 0.247 |
| 15889.93584 | 0.247 |
| 15900.22516 | 0.247 |
| 15909.96648 | 0.247 |
| 15920.24218 | 0.247 |
| 15929.97059 | 0.246 |
| 15940.23264 | 0.246 |
| 15949.94812 | 0.246 |
| 15960.19652 | 0.246 |
| 15969.89905 | 0.246 |
| 15980.13377 | 0.246 |
| 15989.82334 | 0.246 |
| 16000.04436 | 0.245 |